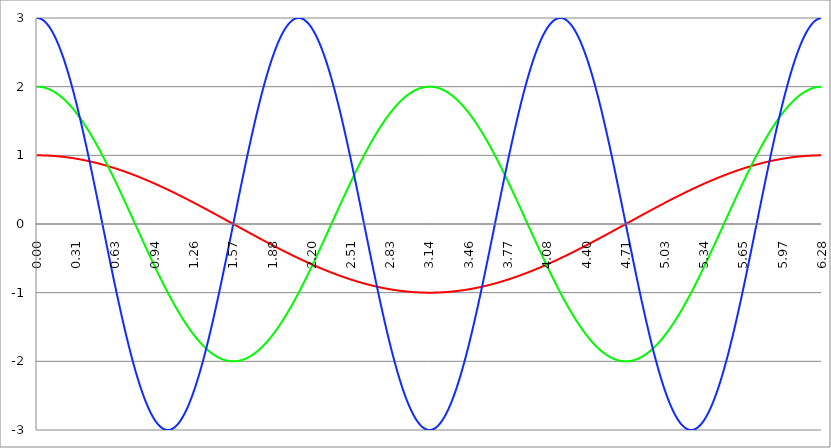
| Category | Series 1 | Series 0 | Series 2 |
|---|---|---|---|
| 0.0 | 1 | 2 | 3 |
| 0.00314159265358979 | 1 | 2 | 3 |
| 0.00628318530717958 | 1 | 2 | 2.999 |
| 0.00942477796076938 | 1 | 2 | 2.999 |
| 0.0125663706143592 | 1 | 1.999 | 2.998 |
| 0.015707963267949 | 1 | 1.999 | 2.997 |
| 0.0188495559215388 | 1 | 1.999 | 2.995 |
| 0.0219911485751285 | 1 | 1.998 | 2.993 |
| 0.0251327412287183 | 1 | 1.997 | 2.991 |
| 0.0282743338823081 | 1 | 1.997 | 2.989 |
| 0.0314159265358979 | 1 | 1.996 | 2.987 |
| 0.0345575191894877 | 0.999 | 1.995 | 2.984 |
| 0.0376991118430775 | 0.999 | 1.994 | 2.981 |
| 0.0408407044966673 | 0.999 | 1.993 | 2.978 |
| 0.0439822971502571 | 0.999 | 1.992 | 2.974 |
| 0.0471238898038469 | 0.999 | 1.991 | 2.97 |
| 0.0502654824574367 | 0.999 | 1.99 | 2.966 |
| 0.0534070751110265 | 0.999 | 1.989 | 2.962 |
| 0.0565486677646163 | 0.998 | 1.987 | 2.957 |
| 0.059690260418206 | 0.998 | 1.986 | 2.952 |
| 0.0628318530717958 | 0.998 | 1.984 | 2.947 |
| 0.0659734457253856 | 0.998 | 1.983 | 2.941 |
| 0.0691150383789754 | 0.998 | 1.981 | 2.936 |
| 0.0722566310325652 | 0.997 | 1.979 | 2.93 |
| 0.075398223686155 | 0.997 | 1.977 | 2.924 |
| 0.0785398163397448 | 0.997 | 1.975 | 2.917 |
| 0.0816814089933346 | 0.997 | 1.973 | 2.91 |
| 0.0848230016469244 | 0.996 | 1.971 | 2.903 |
| 0.0879645943005142 | 0.996 | 1.969 | 2.896 |
| 0.091106186954104 | 0.996 | 1.967 | 2.889 |
| 0.0942477796076937 | 0.996 | 1.965 | 2.881 |
| 0.0973893722612835 | 0.995 | 1.962 | 2.873 |
| 0.100530964914873 | 0.995 | 1.96 | 2.865 |
| 0.103672557568463 | 0.995 | 1.957 | 2.856 |
| 0.106814150222053 | 0.994 | 1.955 | 2.847 |
| 0.109955742875643 | 0.994 | 1.952 | 2.838 |
| 0.113097335529233 | 0.994 | 1.949 | 2.829 |
| 0.116238928182822 | 0.993 | 1.946 | 2.819 |
| 0.119380520836412 | 0.993 | 1.943 | 2.81 |
| 0.122522113490002 | 0.993 | 1.94 | 2.8 |
| 0.125663706143592 | 0.992 | 1.937 | 2.789 |
| 0.128805298797181 | 0.992 | 1.934 | 2.779 |
| 0.131946891450771 | 0.991 | 1.931 | 2.768 |
| 0.135088484104361 | 0.991 | 1.927 | 2.757 |
| 0.138230076757951 | 0.99 | 1.924 | 2.746 |
| 0.141371669411541 | 0.99 | 1.921 | 2.734 |
| 0.14451326206513 | 0.99 | 1.917 | 2.722 |
| 0.14765485471872 | 0.989 | 1.913 | 2.71 |
| 0.15079644737231 | 0.989 | 1.91 | 2.698 |
| 0.1539380400259 | 0.988 | 1.906 | 2.686 |
| 0.15707963267949 | 0.988 | 1.902 | 2.673 |
| 0.160221225333079 | 0.987 | 1.898 | 2.66 |
| 0.163362817986669 | 0.987 | 1.894 | 2.647 |
| 0.166504410640259 | 0.986 | 1.89 | 2.633 |
| 0.169646003293849 | 0.986 | 1.886 | 2.62 |
| 0.172787595947439 | 0.985 | 1.882 | 2.606 |
| 0.175929188601028 | 0.985 | 1.877 | 2.592 |
| 0.179070781254618 | 0.984 | 1.873 | 2.577 |
| 0.182212373908208 | 0.983 | 1.869 | 2.563 |
| 0.185353966561798 | 0.983 | 1.864 | 2.548 |
| 0.188495559215388 | 0.982 | 1.86 | 2.533 |
| 0.191637151868977 | 0.982 | 1.855 | 2.518 |
| 0.194778744522567 | 0.981 | 1.85 | 2.502 |
| 0.197920337176157 | 0.98 | 1.845 | 2.487 |
| 0.201061929829747 | 0.98 | 1.84 | 2.471 |
| 0.204203522483336 | 0.979 | 1.836 | 2.454 |
| 0.207345115136926 | 0.979 | 1.83 | 2.438 |
| 0.210486707790516 | 0.978 | 1.825 | 2.421 |
| 0.213628300444106 | 0.977 | 1.82 | 2.405 |
| 0.216769893097696 | 0.977 | 1.815 | 2.388 |
| 0.219911485751285 | 0.976 | 1.81 | 2.37 |
| 0.223053078404875 | 0.975 | 1.804 | 2.353 |
| 0.226194671058465 | 0.975 | 1.799 | 2.335 |
| 0.229336263712055 | 0.974 | 1.793 | 2.318 |
| 0.232477856365645 | 0.973 | 1.788 | 2.299 |
| 0.235619449019234 | 0.972 | 1.782 | 2.281 |
| 0.238761041672824 | 0.972 | 1.776 | 2.263 |
| 0.241902634326414 | 0.971 | 1.77 | 2.244 |
| 0.245044226980004 | 0.97 | 1.765 | 2.225 |
| 0.248185819633594 | 0.969 | 1.759 | 2.206 |
| 0.251327412287183 | 0.969 | 1.753 | 2.187 |
| 0.254469004940773 | 0.968 | 1.747 | 2.167 |
| 0.257610597594363 | 0.967 | 1.74 | 2.148 |
| 0.260752190247953 | 0.966 | 1.734 | 2.128 |
| 0.263893782901543 | 0.965 | 1.728 | 2.108 |
| 0.267035375555132 | 0.965 | 1.721 | 2.088 |
| 0.270176968208722 | 0.964 | 1.715 | 2.067 |
| 0.273318560862312 | 0.963 | 1.709 | 2.047 |
| 0.276460153515902 | 0.962 | 1.702 | 2.026 |
| 0.279601746169492 | 0.961 | 1.695 | 2.005 |
| 0.282743338823082 | 0.96 | 1.689 | 1.984 |
| 0.285884931476671 | 0.959 | 1.682 | 1.963 |
| 0.289026524130261 | 0.959 | 1.675 | 1.941 |
| 0.292168116783851 | 0.958 | 1.668 | 1.92 |
| 0.295309709437441 | 0.957 | 1.661 | 1.898 |
| 0.298451302091031 | 0.956 | 1.654 | 1.876 |
| 0.30159289474462 | 0.955 | 1.647 | 1.854 |
| 0.30473448739821 | 0.954 | 1.64 | 1.831 |
| 0.3078760800518 | 0.953 | 1.633 | 1.809 |
| 0.31101767270539 | 0.952 | 1.625 | 1.786 |
| 0.31415926535898 | 0.951 | 1.618 | 1.763 |
| 0.31730085801257 | 0.95 | 1.611 | 1.74 |
| 0.320442450666159 | 0.949 | 1.603 | 1.717 |
| 0.323584043319749 | 0.948 | 1.596 | 1.694 |
| 0.326725635973339 | 0.947 | 1.588 | 1.671 |
| 0.329867228626929 | 0.946 | 1.58 | 1.647 |
| 0.333008821280519 | 0.945 | 1.573 | 1.623 |
| 0.336150413934108 | 0.944 | 1.565 | 1.6 |
| 0.339292006587698 | 0.943 | 1.557 | 1.576 |
| 0.342433599241288 | 0.942 | 1.549 | 1.551 |
| 0.345575191894878 | 0.941 | 1.541 | 1.527 |
| 0.348716784548468 | 0.94 | 1.533 | 1.503 |
| 0.351858377202058 | 0.939 | 1.525 | 1.478 |
| 0.354999969855647 | 0.938 | 1.517 | 1.454 |
| 0.358141562509237 | 0.937 | 1.509 | 1.429 |
| 0.361283155162827 | 0.935 | 1.5 | 1.404 |
| 0.364424747816417 | 0.934 | 1.492 | 1.379 |
| 0.367566340470007 | 0.933 | 1.483 | 1.354 |
| 0.370707933123597 | 0.932 | 1.475 | 1.328 |
| 0.373849525777186 | 0.931 | 1.467 | 1.303 |
| 0.376991118430776 | 0.93 | 1.458 | 1.277 |
| 0.380132711084366 | 0.929 | 1.449 | 1.252 |
| 0.383274303737956 | 0.927 | 1.441 | 1.226 |
| 0.386415896391546 | 0.926 | 1.432 | 1.2 |
| 0.389557489045135 | 0.925 | 1.423 | 1.174 |
| 0.392699081698725 | 0.924 | 1.414 | 1.148 |
| 0.395840674352315 | 0.923 | 1.405 | 1.122 |
| 0.398982267005905 | 0.921 | 1.396 | 1.096 |
| 0.402123859659495 | 0.92 | 1.387 | 1.069 |
| 0.405265452313085 | 0.919 | 1.378 | 1.043 |
| 0.408407044966674 | 0.918 | 1.369 | 1.016 |
| 0.411548637620264 | 0.917 | 1.36 | 0.99 |
| 0.414690230273854 | 0.915 | 1.351 | 0.963 |
| 0.417831822927444 | 0.914 | 1.341 | 0.936 |
| 0.420973415581034 | 0.913 | 1.332 | 0.909 |
| 0.424115008234623 | 0.911 | 1.323 | 0.882 |
| 0.427256600888213 | 0.91 | 1.313 | 0.855 |
| 0.430398193541803 | 0.909 | 1.304 | 0.828 |
| 0.433539786195393 | 0.907 | 1.294 | 0.801 |
| 0.436681378848983 | 0.906 | 1.285 | 0.773 |
| 0.439822971502573 | 0.905 | 1.275 | 0.746 |
| 0.442964564156162 | 0.903 | 1.265 | 0.719 |
| 0.446106156809752 | 0.902 | 1.255 | 0.691 |
| 0.449247749463342 | 0.901 | 1.246 | 0.664 |
| 0.452389342116932 | 0.899 | 1.236 | 0.636 |
| 0.455530934770522 | 0.898 | 1.226 | 0.608 |
| 0.458672527424111 | 0.897 | 1.216 | 0.581 |
| 0.461814120077701 | 0.895 | 1.206 | 0.553 |
| 0.464955712731291 | 0.894 | 1.196 | 0.525 |
| 0.468097305384881 | 0.892 | 1.186 | 0.497 |
| 0.471238898038471 | 0.891 | 1.176 | 0.469 |
| 0.474380490692061 | 0.89 | 1.165 | 0.441 |
| 0.47752208334565 | 0.888 | 1.155 | 0.413 |
| 0.48066367599924 | 0.887 | 1.145 | 0.385 |
| 0.48380526865283 | 0.885 | 1.135 | 0.357 |
| 0.48694686130642 | 0.884 | 1.124 | 0.329 |
| 0.49008845396001 | 0.882 | 1.114 | 0.301 |
| 0.493230046613599 | 0.881 | 1.103 | 0.273 |
| 0.496371639267189 | 0.879 | 1.093 | 0.245 |
| 0.499513231920779 | 0.878 | 1.082 | 0.217 |
| 0.502654824574369 | 0.876 | 1.072 | 0.188 |
| 0.505796417227959 | 0.875 | 1.061 | 0.16 |
| 0.508938009881549 | 0.873 | 1.05 | 0.132 |
| 0.512079602535138 | 0.872 | 1.04 | 0.104 |
| 0.515221195188728 | 0.87 | 1.029 | 0.075 |
| 0.518362787842318 | 0.869 | 1.018 | 0.047 |
| 0.521504380495908 | 0.867 | 1.007 | 0.019 |
| 0.524645973149498 | 0.866 | 0.996 | -0.009 |
| 0.527787565803087 | 0.864 | 0.985 | -0.038 |
| 0.530929158456677 | 0.862 | 0.975 | -0.066 |
| 0.534070751110267 | 0.861 | 0.964 | -0.094 |
| 0.537212343763857 | 0.859 | 0.952 | -0.122 |
| 0.540353936417447 | 0.858 | 0.941 | -0.151 |
| 0.543495529071037 | 0.856 | 0.93 | -0.179 |
| 0.546637121724626 | 0.854 | 0.919 | -0.207 |
| 0.549778714378216 | 0.853 | 0.908 | -0.235 |
| 0.552920307031806 | 0.851 | 0.897 | -0.264 |
| 0.556061899685396 | 0.849 | 0.886 | -0.292 |
| 0.559203492338986 | 0.848 | 0.874 | -0.32 |
| 0.562345084992576 | 0.846 | 0.863 | -0.348 |
| 0.565486677646165 | 0.844 | 0.852 | -0.376 |
| 0.568628270299755 | 0.843 | 0.84 | -0.404 |
| 0.571769862953345 | 0.841 | 0.829 | -0.432 |
| 0.574911455606935 | 0.839 | 0.817 | -0.46 |
| 0.578053048260525 | 0.838 | 0.806 | -0.488 |
| 0.581194640914114 | 0.836 | 0.794 | -0.516 |
| 0.584336233567704 | 0.834 | 0.783 | -0.544 |
| 0.587477826221294 | 0.832 | 0.771 | -0.571 |
| 0.590619418874884 | 0.831 | 0.76 | -0.599 |
| 0.593761011528474 | 0.829 | 0.748 | -0.627 |
| 0.596902604182064 | 0.827 | 0.736 | -0.654 |
| 0.600044196835653 | 0.825 | 0.725 | -0.682 |
| 0.603185789489243 | 0.824 | 0.713 | -0.709 |
| 0.606327382142833 | 0.822 | 0.701 | -0.737 |
| 0.609468974796423 | 0.82 | 0.689 | -0.764 |
| 0.612610567450013 | 0.818 | 0.677 | -0.792 |
| 0.615752160103602 | 0.816 | 0.666 | -0.819 |
| 0.618893752757192 | 0.815 | 0.654 | -0.846 |
| 0.622035345410782 | 0.813 | 0.642 | -0.873 |
| 0.625176938064372 | 0.811 | 0.63 | -0.9 |
| 0.628318530717962 | 0.809 | 0.618 | -0.927 |
| 0.631460123371551 | 0.807 | 0.606 | -0.954 |
| 0.634601716025141 | 0.805 | 0.594 | -0.981 |
| 0.637743308678731 | 0.803 | 0.582 | -1.007 |
| 0.640884901332321 | 0.802 | 0.57 | -1.034 |
| 0.644026493985911 | 0.8 | 0.558 | -1.06 |
| 0.647168086639501 | 0.798 | 0.546 | -1.087 |
| 0.65030967929309 | 0.796 | 0.534 | -1.113 |
| 0.65345127194668 | 0.794 | 0.522 | -1.139 |
| 0.65659286460027 | 0.792 | 0.51 | -1.165 |
| 0.65973445725386 | 0.79 | 0.497 | -1.191 |
| 0.66287604990745 | 0.788 | 0.485 | -1.217 |
| 0.666017642561039 | 0.786 | 0.473 | -1.243 |
| 0.669159235214629 | 0.784 | 0.461 | -1.269 |
| 0.672300827868219 | 0.782 | 0.449 | -1.294 |
| 0.675442420521809 | 0.78 | 0.436 | -1.32 |
| 0.678584013175399 | 0.778 | 0.424 | -1.345 |
| 0.681725605828989 | 0.776 | 0.412 | -1.37 |
| 0.684867198482578 | 0.775 | 0.399 | -1.395 |
| 0.688008791136168 | 0.773 | 0.387 | -1.42 |
| 0.691150383789758 | 0.771 | 0.375 | -1.445 |
| 0.694291976443348 | 0.769 | 0.362 | -1.47 |
| 0.697433569096938 | 0.766 | 0.35 | -1.495 |
| 0.700575161750528 | 0.764 | 0.338 | -1.519 |
| 0.703716754404117 | 0.762 | 0.325 | -1.543 |
| 0.706858347057707 | 0.76 | 0.313 | -1.567 |
| 0.709999939711297 | 0.758 | 0.3 | -1.592 |
| 0.713141532364887 | 0.756 | 0.288 | -1.615 |
| 0.716283125018477 | 0.754 | 0.276 | -1.639 |
| 0.719424717672066 | 0.752 | 0.263 | -1.663 |
| 0.722566310325656 | 0.75 | 0.251 | -1.686 |
| 0.725707902979246 | 0.748 | 0.238 | -1.71 |
| 0.728849495632836 | 0.746 | 0.226 | -1.733 |
| 0.731991088286426 | 0.744 | 0.213 | -1.756 |
| 0.735132680940016 | 0.742 | 0.201 | -1.779 |
| 0.738274273593605 | 0.74 | 0.188 | -1.801 |
| 0.741415866247195 | 0.738 | 0.176 | -1.824 |
| 0.744557458900785 | 0.735 | 0.163 | -1.846 |
| 0.747699051554375 | 0.733 | 0.151 | -1.868 |
| 0.750840644207965 | 0.731 | 0.138 | -1.89 |
| 0.753982236861554 | 0.729 | 0.126 | -1.912 |
| 0.757123829515144 | 0.727 | 0.113 | -1.934 |
| 0.760265422168734 | 0.725 | 0.1 | -1.956 |
| 0.763407014822324 | 0.722 | 0.088 | -1.977 |
| 0.766548607475914 | 0.72 | 0.075 | -1.998 |
| 0.769690200129504 | 0.718 | 0.063 | -2.019 |
| 0.772831792783093 | 0.716 | 0.05 | -2.04 |
| 0.775973385436683 | 0.714 | 0.038 | -2.061 |
| 0.779114978090273 | 0.712 | 0.025 | -2.081 |
| 0.782256570743863 | 0.709 | 0.013 | -2.101 |
| 0.785398163397453 | 0.707 | 0 | -2.121 |
| 0.788539756051042 | 0.705 | -0.013 | -2.141 |
| 0.791681348704632 | 0.703 | -0.025 | -2.161 |
| 0.794822941358222 | 0.7 | -0.038 | -2.18 |
| 0.797964534011812 | 0.698 | -0.05 | -2.2 |
| 0.801106126665402 | 0.696 | -0.063 | -2.219 |
| 0.804247719318992 | 0.694 | -0.075 | -2.238 |
| 0.807389311972581 | 0.691 | -0.088 | -2.257 |
| 0.810530904626171 | 0.689 | -0.1 | -2.275 |
| 0.813672497279761 | 0.687 | -0.113 | -2.293 |
| 0.816814089933351 | 0.685 | -0.126 | -2.312 |
| 0.819955682586941 | 0.682 | -0.138 | -2.329 |
| 0.823097275240531 | 0.68 | -0.151 | -2.347 |
| 0.82623886789412 | 0.678 | -0.163 | -2.365 |
| 0.82938046054771 | 0.675 | -0.176 | -2.382 |
| 0.8325220532013 | 0.673 | -0.188 | -2.399 |
| 0.83566364585489 | 0.671 | -0.201 | -2.416 |
| 0.83880523850848 | 0.668 | -0.213 | -2.433 |
| 0.841946831162069 | 0.666 | -0.226 | -2.449 |
| 0.845088423815659 | 0.664 | -0.238 | -2.465 |
| 0.848230016469249 | 0.661 | -0.251 | -2.481 |
| 0.851371609122839 | 0.659 | -0.263 | -2.497 |
| 0.854513201776429 | 0.657 | -0.276 | -2.513 |
| 0.857654794430019 | 0.654 | -0.288 | -2.528 |
| 0.860796387083608 | 0.652 | -0.3 | -2.543 |
| 0.863937979737198 | 0.649 | -0.313 | -2.558 |
| 0.867079572390788 | 0.647 | -0.325 | -2.573 |
| 0.870221165044378 | 0.645 | -0.338 | -2.587 |
| 0.873362757697968 | 0.642 | -0.35 | -2.601 |
| 0.876504350351557 | 0.64 | -0.362 | -2.615 |
| 0.879645943005147 | 0.637 | -0.375 | -2.629 |
| 0.882787535658737 | 0.635 | -0.387 | -2.642 |
| 0.885929128312327 | 0.633 | -0.399 | -2.656 |
| 0.889070720965917 | 0.63 | -0.412 | -2.669 |
| 0.892212313619507 | 0.628 | -0.424 | -2.682 |
| 0.895353906273096 | 0.625 | -0.436 | -2.694 |
| 0.898495498926686 | 0.623 | -0.449 | -2.706 |
| 0.901637091580276 | 0.62 | -0.461 | -2.718 |
| 0.904778684233866 | 0.618 | -0.473 | -2.73 |
| 0.907920276887456 | 0.615 | -0.485 | -2.742 |
| 0.911061869541045 | 0.613 | -0.497 | -2.753 |
| 0.914203462194635 | 0.61 | -0.51 | -2.764 |
| 0.917345054848225 | 0.608 | -0.522 | -2.775 |
| 0.920486647501815 | 0.605 | -0.534 | -2.786 |
| 0.923628240155405 | 0.603 | -0.546 | -2.796 |
| 0.926769832808995 | 0.6 | -0.558 | -2.806 |
| 0.929911425462584 | 0.598 | -0.57 | -2.816 |
| 0.933053018116174 | 0.595 | -0.582 | -2.826 |
| 0.936194610769764 | 0.593 | -0.594 | -2.835 |
| 0.939336203423354 | 0.59 | -0.606 | -2.844 |
| 0.942477796076944 | 0.588 | -0.618 | -2.853 |
| 0.945619388730533 | 0.585 | -0.63 | -2.862 |
| 0.948760981384123 | 0.583 | -0.642 | -2.87 |
| 0.951902574037713 | 0.58 | -0.654 | -2.878 |
| 0.955044166691303 | 0.578 | -0.666 | -2.886 |
| 0.958185759344893 | 0.575 | -0.677 | -2.894 |
| 0.961327351998483 | 0.572 | -0.689 | -2.901 |
| 0.964468944652072 | 0.57 | -0.701 | -2.908 |
| 0.967610537305662 | 0.567 | -0.713 | -2.915 |
| 0.970752129959252 | 0.565 | -0.725 | -2.921 |
| 0.973893722612842 | 0.562 | -0.736 | -2.928 |
| 0.977035315266432 | 0.559 | -0.748 | -2.934 |
| 0.980176907920022 | 0.557 | -0.76 | -2.94 |
| 0.983318500573611 | 0.554 | -0.771 | -2.945 |
| 0.986460093227201 | 0.552 | -0.783 | -2.95 |
| 0.989601685880791 | 0.549 | -0.794 | -2.955 |
| 0.992743278534381 | 0.546 | -0.806 | -2.96 |
| 0.995884871187971 | 0.544 | -0.817 | -2.965 |
| 0.99902646384156 | 0.541 | -0.829 | -2.969 |
| 1.00216805649515 | 0.538 | -0.84 | -2.973 |
| 1.00530964914874 | 0.536 | -0.852 | -2.976 |
| 1.00845124180233 | 0.533 | -0.863 | -2.98 |
| 1.01159283445592 | 0.531 | -0.874 | -2.983 |
| 1.01473442710951 | 0.528 | -0.886 | -2.986 |
| 1.017876019763099 | 0.525 | -0.897 | -2.988 |
| 1.021017612416689 | 0.522 | -0.908 | -2.991 |
| 1.02415920507028 | 0.52 | -0.919 | -2.993 |
| 1.027300797723869 | 0.517 | -0.93 | -2.995 |
| 1.030442390377459 | 0.514 | -0.941 | -2.996 |
| 1.033583983031048 | 0.512 | -0.952 | -2.997 |
| 1.036725575684638 | 0.509 | -0.964 | -2.999 |
| 1.039867168338228 | 0.506 | -0.975 | -2.999 |
| 1.043008760991818 | 0.504 | -0.985 | -3 |
| 1.046150353645408 | 0.501 | -0.996 | -3 |
| 1.049291946298998 | 0.498 | -1.007 | -3 |
| 1.052433538952587 | 0.495 | -1.018 | -3 |
| 1.055575131606177 | 0.493 | -1.029 | -2.999 |
| 1.058716724259767 | 0.49 | -1.04 | -2.998 |
| 1.061858316913357 | 0.487 | -1.05 | -2.997 |
| 1.064999909566947 | 0.485 | -1.061 | -2.996 |
| 1.068141502220536 | 0.482 | -1.072 | -2.994 |
| 1.071283094874126 | 0.479 | -1.082 | -2.992 |
| 1.074424687527716 | 0.476 | -1.093 | -2.99 |
| 1.077566280181306 | 0.473 | -1.103 | -2.988 |
| 1.080707872834896 | 0.471 | -1.114 | -2.985 |
| 1.083849465488486 | 0.468 | -1.124 | -2.982 |
| 1.086991058142075 | 0.465 | -1.135 | -2.979 |
| 1.090132650795665 | 0.462 | -1.145 | -2.975 |
| 1.093274243449255 | 0.46 | -1.155 | -2.971 |
| 1.096415836102845 | 0.457 | -1.165 | -2.967 |
| 1.099557428756435 | 0.454 | -1.176 | -2.963 |
| 1.102699021410025 | 0.451 | -1.186 | -2.959 |
| 1.105840614063614 | 0.448 | -1.196 | -2.954 |
| 1.108982206717204 | 0.446 | -1.206 | -2.949 |
| 1.112123799370794 | 0.443 | -1.216 | -2.943 |
| 1.115265392024384 | 0.44 | -1.226 | -2.938 |
| 1.118406984677974 | 0.437 | -1.236 | -2.932 |
| 1.121548577331563 | 0.434 | -1.246 | -2.926 |
| 1.124690169985153 | 0.431 | -1.255 | -2.919 |
| 1.127831762638743 | 0.429 | -1.265 | -2.913 |
| 1.130973355292333 | 0.426 | -1.275 | -2.906 |
| 1.134114947945923 | 0.423 | -1.285 | -2.899 |
| 1.137256540599513 | 0.42 | -1.294 | -2.891 |
| 1.140398133253102 | 0.417 | -1.304 | -2.883 |
| 1.143539725906692 | 0.414 | -1.313 | -2.876 |
| 1.146681318560282 | 0.412 | -1.323 | -2.867 |
| 1.149822911213872 | 0.409 | -1.332 | -2.859 |
| 1.152964503867462 | 0.406 | -1.341 | -2.85 |
| 1.156106096521051 | 0.403 | -1.351 | -2.841 |
| 1.159247689174641 | 0.4 | -1.36 | -2.832 |
| 1.162389281828231 | 0.397 | -1.369 | -2.823 |
| 1.165530874481821 | 0.394 | -1.378 | -2.813 |
| 1.168672467135411 | 0.391 | -1.387 | -2.803 |
| 1.171814059789001 | 0.388 | -1.396 | -2.793 |
| 1.17495565244259 | 0.386 | -1.405 | -2.782 |
| 1.17809724509618 | 0.383 | -1.414 | -2.772 |
| 1.18123883774977 | 0.38 | -1.423 | -2.761 |
| 1.18438043040336 | 0.377 | -1.432 | -2.75 |
| 1.18752202305695 | 0.374 | -1.441 | -2.738 |
| 1.190663615710539 | 0.371 | -1.449 | -2.726 |
| 1.193805208364129 | 0.368 | -1.458 | -2.714 |
| 1.19694680101772 | 0.365 | -1.467 | -2.702 |
| 1.200088393671309 | 0.362 | -1.475 | -2.69 |
| 1.203229986324899 | 0.359 | -1.483 | -2.677 |
| 1.206371578978489 | 0.356 | -1.492 | -2.664 |
| 1.209513171632078 | 0.353 | -1.5 | -2.651 |
| 1.212654764285668 | 0.351 | -1.509 | -2.638 |
| 1.215796356939258 | 0.348 | -1.517 | -2.624 |
| 1.218937949592848 | 0.345 | -1.525 | -2.611 |
| 1.222079542246438 | 0.342 | -1.533 | -2.597 |
| 1.225221134900027 | 0.339 | -1.541 | -2.582 |
| 1.228362727553617 | 0.336 | -1.549 | -2.568 |
| 1.231504320207207 | 0.333 | -1.557 | -2.553 |
| 1.234645912860797 | 0.33 | -1.565 | -2.538 |
| 1.237787505514387 | 0.327 | -1.573 | -2.523 |
| 1.240929098167977 | 0.324 | -1.58 | -2.507 |
| 1.244070690821566 | 0.321 | -1.588 | -2.492 |
| 1.247212283475156 | 0.318 | -1.596 | -2.476 |
| 1.250353876128746 | 0.315 | -1.603 | -2.46 |
| 1.253495468782336 | 0.312 | -1.611 | -2.444 |
| 1.256637061435926 | 0.309 | -1.618 | -2.427 |
| 1.259778654089515 | 0.306 | -1.625 | -2.41 |
| 1.262920246743105 | 0.303 | -1.633 | -2.393 |
| 1.266061839396695 | 0.3 | -1.64 | -2.376 |
| 1.269203432050285 | 0.297 | -1.647 | -2.359 |
| 1.272345024703875 | 0.294 | -1.654 | -2.341 |
| 1.275486617357465 | 0.291 | -1.661 | -2.324 |
| 1.278628210011054 | 0.288 | -1.668 | -2.306 |
| 1.281769802664644 | 0.285 | -1.675 | -2.287 |
| 1.284911395318234 | 0.282 | -1.682 | -2.269 |
| 1.288052987971824 | 0.279 | -1.689 | -2.25 |
| 1.291194580625414 | 0.276 | -1.695 | -2.232 |
| 1.294336173279003 | 0.273 | -1.702 | -2.213 |
| 1.297477765932593 | 0.27 | -1.709 | -2.193 |
| 1.300619358586183 | 0.267 | -1.715 | -2.174 |
| 1.303760951239773 | 0.264 | -1.721 | -2.154 |
| 1.306902543893363 | 0.261 | -1.728 | -2.135 |
| 1.310044136546953 | 0.258 | -1.734 | -2.115 |
| 1.313185729200542 | 0.255 | -1.74 | -2.094 |
| 1.316327321854132 | 0.252 | -1.747 | -2.074 |
| 1.319468914507722 | 0.249 | -1.753 | -2.054 |
| 1.322610507161312 | 0.246 | -1.759 | -2.033 |
| 1.325752099814902 | 0.243 | -1.765 | -2.012 |
| 1.328893692468491 | 0.24 | -1.77 | -1.991 |
| 1.332035285122081 | 0.236 | -1.776 | -1.97 |
| 1.335176877775671 | 0.233 | -1.782 | -1.948 |
| 1.338318470429261 | 0.23 | -1.788 | -1.927 |
| 1.341460063082851 | 0.227 | -1.793 | -1.905 |
| 1.344601655736441 | 0.224 | -1.799 | -1.883 |
| 1.34774324839003 | 0.221 | -1.804 | -1.861 |
| 1.35088484104362 | 0.218 | -1.81 | -1.839 |
| 1.35402643369721 | 0.215 | -1.815 | -1.816 |
| 1.3571680263508 | 0.212 | -1.82 | -1.794 |
| 1.36030961900439 | 0.209 | -1.825 | -1.771 |
| 1.363451211657979 | 0.206 | -1.83 | -1.748 |
| 1.36659280431157 | 0.203 | -1.836 | -1.725 |
| 1.369734396965159 | 0.2 | -1.84 | -1.702 |
| 1.372875989618749 | 0.197 | -1.845 | -1.678 |
| 1.376017582272339 | 0.194 | -1.85 | -1.655 |
| 1.379159174925929 | 0.19 | -1.855 | -1.631 |
| 1.382300767579518 | 0.187 | -1.86 | -1.607 |
| 1.385442360233108 | 0.184 | -1.864 | -1.584 |
| 1.388583952886698 | 0.181 | -1.869 | -1.559 |
| 1.391725545540288 | 0.178 | -1.873 | -1.535 |
| 1.394867138193878 | 0.175 | -1.877 | -1.511 |
| 1.398008730847468 | 0.172 | -1.882 | -1.486 |
| 1.401150323501057 | 0.169 | -1.886 | -1.462 |
| 1.404291916154647 | 0.166 | -1.89 | -1.437 |
| 1.407433508808237 | 0.163 | -1.894 | -1.412 |
| 1.410575101461827 | 0.16 | -1.898 | -1.387 |
| 1.413716694115417 | 0.156 | -1.902 | -1.362 |
| 1.416858286769006 | 0.153 | -1.906 | -1.337 |
| 1.419999879422596 | 0.15 | -1.91 | -1.311 |
| 1.423141472076186 | 0.147 | -1.913 | -1.286 |
| 1.426283064729776 | 0.144 | -1.917 | -1.26 |
| 1.429424657383366 | 0.141 | -1.921 | -1.235 |
| 1.432566250036956 | 0.138 | -1.924 | -1.209 |
| 1.435707842690545 | 0.135 | -1.927 | -1.183 |
| 1.438849435344135 | 0.132 | -1.931 | -1.157 |
| 1.441991027997725 | 0.128 | -1.934 | -1.131 |
| 1.445132620651315 | 0.125 | -1.937 | -1.104 |
| 1.448274213304905 | 0.122 | -1.94 | -1.078 |
| 1.451415805958494 | 0.119 | -1.943 | -1.052 |
| 1.454557398612084 | 0.116 | -1.946 | -1.025 |
| 1.457698991265674 | 0.113 | -1.949 | -0.998 |
| 1.460840583919264 | 0.11 | -1.952 | -0.972 |
| 1.463982176572854 | 0.107 | -1.955 | -0.945 |
| 1.467123769226444 | 0.103 | -1.957 | -0.918 |
| 1.470265361880033 | 0.1 | -1.96 | -0.891 |
| 1.473406954533623 | 0.097 | -1.962 | -0.864 |
| 1.476548547187213 | 0.094 | -1.965 | -0.837 |
| 1.479690139840803 | 0.091 | -1.967 | -0.81 |
| 1.482831732494393 | 0.088 | -1.969 | -0.783 |
| 1.485973325147982 | 0.085 | -1.971 | -0.755 |
| 1.489114917801572 | 0.082 | -1.973 | -0.728 |
| 1.492256510455162 | 0.078 | -1.975 | -0.7 |
| 1.495398103108752 | 0.075 | -1.977 | -0.673 |
| 1.498539695762342 | 0.072 | -1.979 | -0.645 |
| 1.501681288415932 | 0.069 | -1.981 | -0.618 |
| 1.504822881069521 | 0.066 | -1.983 | -0.59 |
| 1.507964473723111 | 0.063 | -1.984 | -0.562 |
| 1.511106066376701 | 0.06 | -1.986 | -0.534 |
| 1.514247659030291 | 0.057 | -1.987 | -0.507 |
| 1.517389251683881 | 0.053 | -1.989 | -0.479 |
| 1.520530844337471 | 0.05 | -1.99 | -0.451 |
| 1.52367243699106 | 0.047 | -1.991 | -0.423 |
| 1.52681402964465 | 0.044 | -1.992 | -0.395 |
| 1.52995562229824 | 0.041 | -1.993 | -0.367 |
| 1.53309721495183 | 0.038 | -1.994 | -0.339 |
| 1.53623880760542 | 0.035 | -1.995 | -0.31 |
| 1.539380400259009 | 0.031 | -1.996 | -0.282 |
| 1.542521992912599 | 0.028 | -1.997 | -0.254 |
| 1.545663585566189 | 0.025 | -1.997 | -0.226 |
| 1.548805178219779 | 0.022 | -1.998 | -0.198 |
| 1.551946770873369 | 0.019 | -1.999 | -0.17 |
| 1.555088363526959 | 0.016 | -1.999 | -0.141 |
| 1.558229956180548 | 0.013 | -1.999 | -0.113 |
| 1.561371548834138 | 0.009 | -2 | -0.085 |
| 1.564513141487728 | 0.006 | -2 | -0.057 |
| 1.567654734141318 | 0.003 | -2 | -0.028 |
| 1.570796326794908 | 0 | -2 | 0 |
| 1.573937919448497 | -0.003 | -2 | 0.028 |
| 1.577079512102087 | -0.006 | -2 | 0.057 |
| 1.580221104755677 | -0.009 | -2 | 0.085 |
| 1.583362697409267 | -0.013 | -1.999 | 0.113 |
| 1.586504290062857 | -0.016 | -1.999 | 0.141 |
| 1.589645882716447 | -0.019 | -1.999 | 0.17 |
| 1.592787475370036 | -0.022 | -1.998 | 0.198 |
| 1.595929068023626 | -0.025 | -1.997 | 0.226 |
| 1.599070660677216 | -0.028 | -1.997 | 0.254 |
| 1.602212253330806 | -0.031 | -1.996 | 0.282 |
| 1.605353845984396 | -0.035 | -1.995 | 0.31 |
| 1.608495438637985 | -0.038 | -1.994 | 0.339 |
| 1.611637031291575 | -0.041 | -1.993 | 0.367 |
| 1.614778623945165 | -0.044 | -1.992 | 0.395 |
| 1.617920216598755 | -0.047 | -1.991 | 0.423 |
| 1.621061809252345 | -0.05 | -1.99 | 0.451 |
| 1.624203401905935 | -0.053 | -1.989 | 0.479 |
| 1.627344994559524 | -0.057 | -1.987 | 0.507 |
| 1.630486587213114 | -0.06 | -1.986 | 0.534 |
| 1.633628179866704 | -0.063 | -1.984 | 0.562 |
| 1.636769772520294 | -0.066 | -1.983 | 0.59 |
| 1.639911365173884 | -0.069 | -1.981 | 0.618 |
| 1.643052957827473 | -0.072 | -1.979 | 0.645 |
| 1.646194550481063 | -0.075 | -1.977 | 0.673 |
| 1.649336143134653 | -0.078 | -1.975 | 0.7 |
| 1.652477735788243 | -0.082 | -1.973 | 0.728 |
| 1.655619328441833 | -0.085 | -1.971 | 0.755 |
| 1.658760921095423 | -0.088 | -1.969 | 0.783 |
| 1.661902513749012 | -0.091 | -1.967 | 0.81 |
| 1.665044106402602 | -0.094 | -1.965 | 0.837 |
| 1.668185699056192 | -0.097 | -1.962 | 0.864 |
| 1.671327291709782 | -0.1 | -1.96 | 0.891 |
| 1.674468884363372 | -0.103 | -1.957 | 0.918 |
| 1.677610477016961 | -0.107 | -1.955 | 0.945 |
| 1.680752069670551 | -0.11 | -1.952 | 0.972 |
| 1.683893662324141 | -0.113 | -1.949 | 0.998 |
| 1.687035254977731 | -0.116 | -1.946 | 1.025 |
| 1.690176847631321 | -0.119 | -1.943 | 1.052 |
| 1.693318440284911 | -0.122 | -1.94 | 1.078 |
| 1.6964600329385 | -0.125 | -1.937 | 1.104 |
| 1.69960162559209 | -0.128 | -1.934 | 1.131 |
| 1.70274321824568 | -0.132 | -1.931 | 1.157 |
| 1.70588481089927 | -0.135 | -1.927 | 1.183 |
| 1.70902640355286 | -0.138 | -1.924 | 1.209 |
| 1.712167996206449 | -0.141 | -1.921 | 1.235 |
| 1.715309588860039 | -0.144 | -1.917 | 1.26 |
| 1.71845118151363 | -0.147 | -1.913 | 1.286 |
| 1.721592774167219 | -0.15 | -1.91 | 1.311 |
| 1.724734366820809 | -0.153 | -1.906 | 1.337 |
| 1.727875959474399 | -0.156 | -1.902 | 1.362 |
| 1.731017552127988 | -0.16 | -1.898 | 1.387 |
| 1.734159144781578 | -0.163 | -1.894 | 1.412 |
| 1.737300737435168 | -0.166 | -1.89 | 1.437 |
| 1.740442330088758 | -0.169 | -1.886 | 1.462 |
| 1.743583922742348 | -0.172 | -1.882 | 1.486 |
| 1.746725515395937 | -0.175 | -1.877 | 1.511 |
| 1.749867108049527 | -0.178 | -1.873 | 1.535 |
| 1.753008700703117 | -0.181 | -1.869 | 1.559 |
| 1.756150293356707 | -0.184 | -1.864 | 1.584 |
| 1.759291886010297 | -0.187 | -1.86 | 1.607 |
| 1.762433478663887 | -0.19 | -1.855 | 1.631 |
| 1.765575071317476 | -0.194 | -1.85 | 1.655 |
| 1.768716663971066 | -0.197 | -1.845 | 1.678 |
| 1.771858256624656 | -0.2 | -1.84 | 1.702 |
| 1.774999849278246 | -0.203 | -1.836 | 1.725 |
| 1.778141441931836 | -0.206 | -1.83 | 1.748 |
| 1.781283034585426 | -0.209 | -1.825 | 1.771 |
| 1.784424627239015 | -0.212 | -1.82 | 1.794 |
| 1.787566219892605 | -0.215 | -1.815 | 1.816 |
| 1.790707812546195 | -0.218 | -1.81 | 1.839 |
| 1.793849405199785 | -0.221 | -1.804 | 1.861 |
| 1.796990997853375 | -0.224 | -1.799 | 1.883 |
| 1.800132590506964 | -0.227 | -1.793 | 1.905 |
| 1.803274183160554 | -0.23 | -1.788 | 1.927 |
| 1.806415775814144 | -0.233 | -1.782 | 1.948 |
| 1.809557368467734 | -0.236 | -1.776 | 1.97 |
| 1.812698961121324 | -0.24 | -1.77 | 1.991 |
| 1.815840553774914 | -0.243 | -1.765 | 2.012 |
| 1.818982146428503 | -0.246 | -1.759 | 2.033 |
| 1.822123739082093 | -0.249 | -1.753 | 2.054 |
| 1.825265331735683 | -0.252 | -1.747 | 2.074 |
| 1.828406924389273 | -0.255 | -1.74 | 2.094 |
| 1.831548517042863 | -0.258 | -1.734 | 2.115 |
| 1.834690109696452 | -0.261 | -1.728 | 2.135 |
| 1.837831702350042 | -0.264 | -1.721 | 2.154 |
| 1.840973295003632 | -0.267 | -1.715 | 2.174 |
| 1.844114887657222 | -0.27 | -1.709 | 2.193 |
| 1.847256480310812 | -0.273 | -1.702 | 2.213 |
| 1.850398072964402 | -0.276 | -1.695 | 2.232 |
| 1.853539665617991 | -0.279 | -1.689 | 2.25 |
| 1.856681258271581 | -0.282 | -1.682 | 2.269 |
| 1.859822850925171 | -0.285 | -1.675 | 2.287 |
| 1.862964443578761 | -0.288 | -1.668 | 2.306 |
| 1.866106036232351 | -0.291 | -1.661 | 2.324 |
| 1.86924762888594 | -0.294 | -1.654 | 2.341 |
| 1.87238922153953 | -0.297 | -1.647 | 2.359 |
| 1.87553081419312 | -0.3 | -1.64 | 2.376 |
| 1.87867240684671 | -0.303 | -1.633 | 2.393 |
| 1.8818139995003 | -0.306 | -1.625 | 2.41 |
| 1.88495559215389 | -0.309 | -1.618 | 2.427 |
| 1.888097184807479 | -0.312 | -1.611 | 2.444 |
| 1.891238777461069 | -0.315 | -1.603 | 2.46 |
| 1.89438037011466 | -0.318 | -1.596 | 2.476 |
| 1.897521962768249 | -0.321 | -1.588 | 2.492 |
| 1.900663555421839 | -0.324 | -1.58 | 2.507 |
| 1.903805148075429 | -0.327 | -1.573 | 2.523 |
| 1.906946740729018 | -0.33 | -1.565 | 2.538 |
| 1.910088333382608 | -0.333 | -1.557 | 2.553 |
| 1.913229926036198 | -0.336 | -1.549 | 2.568 |
| 1.916371518689788 | -0.339 | -1.541 | 2.582 |
| 1.919513111343378 | -0.342 | -1.533 | 2.597 |
| 1.922654703996967 | -0.345 | -1.525 | 2.611 |
| 1.925796296650557 | -0.348 | -1.517 | 2.624 |
| 1.928937889304147 | -0.351 | -1.509 | 2.638 |
| 1.932079481957737 | -0.353 | -1.5 | 2.651 |
| 1.935221074611327 | -0.356 | -1.492 | 2.664 |
| 1.938362667264917 | -0.359 | -1.483 | 2.677 |
| 1.941504259918506 | -0.362 | -1.475 | 2.69 |
| 1.944645852572096 | -0.365 | -1.467 | 2.702 |
| 1.947787445225686 | -0.368 | -1.458 | 2.714 |
| 1.950929037879276 | -0.371 | -1.449 | 2.726 |
| 1.954070630532866 | -0.374 | -1.441 | 2.738 |
| 1.957212223186455 | -0.377 | -1.432 | 2.75 |
| 1.960353815840045 | -0.38 | -1.423 | 2.761 |
| 1.963495408493635 | -0.383 | -1.414 | 2.772 |
| 1.966637001147225 | -0.386 | -1.405 | 2.782 |
| 1.969778593800815 | -0.388 | -1.396 | 2.793 |
| 1.972920186454405 | -0.391 | -1.387 | 2.803 |
| 1.976061779107994 | -0.394 | -1.378 | 2.813 |
| 1.979203371761584 | -0.397 | -1.369 | 2.823 |
| 1.982344964415174 | -0.4 | -1.36 | 2.832 |
| 1.985486557068764 | -0.403 | -1.351 | 2.841 |
| 1.988628149722354 | -0.406 | -1.341 | 2.85 |
| 1.991769742375943 | -0.409 | -1.332 | 2.859 |
| 1.994911335029533 | -0.412 | -1.323 | 2.867 |
| 1.998052927683123 | -0.414 | -1.313 | 2.876 |
| 2.001194520336712 | -0.417 | -1.304 | 2.883 |
| 2.004336112990302 | -0.42 | -1.294 | 2.891 |
| 2.007477705643892 | -0.423 | -1.285 | 2.899 |
| 2.010619298297482 | -0.426 | -1.275 | 2.906 |
| 2.013760890951071 | -0.429 | -1.265 | 2.913 |
| 2.016902483604661 | -0.431 | -1.255 | 2.919 |
| 2.02004407625825 | -0.434 | -1.246 | 2.926 |
| 2.02318566891184 | -0.437 | -1.236 | 2.932 |
| 2.02632726156543 | -0.44 | -1.226 | 2.938 |
| 2.029468854219019 | -0.443 | -1.216 | 2.943 |
| 2.032610446872609 | -0.446 | -1.206 | 2.949 |
| 2.035752039526198 | -0.448 | -1.196 | 2.954 |
| 2.038893632179788 | -0.451 | -1.186 | 2.959 |
| 2.042035224833378 | -0.454 | -1.176 | 2.963 |
| 2.045176817486967 | -0.457 | -1.165 | 2.967 |
| 2.048318410140557 | -0.46 | -1.155 | 2.971 |
| 2.051460002794146 | -0.462 | -1.145 | 2.975 |
| 2.054601595447736 | -0.465 | -1.135 | 2.979 |
| 2.057743188101325 | -0.468 | -1.124 | 2.982 |
| 2.060884780754915 | -0.471 | -1.114 | 2.985 |
| 2.064026373408505 | -0.473 | -1.103 | 2.988 |
| 2.067167966062094 | -0.476 | -1.093 | 2.99 |
| 2.070309558715684 | -0.479 | -1.082 | 2.992 |
| 2.073451151369273 | -0.482 | -1.072 | 2.994 |
| 2.076592744022863 | -0.485 | -1.061 | 2.996 |
| 2.079734336676452 | -0.487 | -1.05 | 2.997 |
| 2.082875929330042 | -0.49 | -1.04 | 2.998 |
| 2.086017521983632 | -0.493 | -1.029 | 2.999 |
| 2.089159114637221 | -0.495 | -1.018 | 3 |
| 2.092300707290811 | -0.498 | -1.007 | 3 |
| 2.095442299944401 | -0.501 | -0.996 | 3 |
| 2.09858389259799 | -0.504 | -0.985 | 3 |
| 2.10172548525158 | -0.506 | -0.975 | 2.999 |
| 2.104867077905169 | -0.509 | -0.964 | 2.999 |
| 2.108008670558759 | -0.512 | -0.952 | 2.997 |
| 2.111150263212349 | -0.514 | -0.941 | 2.996 |
| 2.114291855865938 | -0.517 | -0.93 | 2.995 |
| 2.117433448519528 | -0.52 | -0.919 | 2.993 |
| 2.120575041173117 | -0.522 | -0.908 | 2.991 |
| 2.123716633826707 | -0.525 | -0.897 | 2.988 |
| 2.126858226480297 | -0.528 | -0.886 | 2.986 |
| 2.129999819133886 | -0.531 | -0.874 | 2.983 |
| 2.133141411787476 | -0.533 | -0.863 | 2.98 |
| 2.136283004441065 | -0.536 | -0.852 | 2.976 |
| 2.139424597094655 | -0.538 | -0.84 | 2.973 |
| 2.142566189748245 | -0.541 | -0.829 | 2.969 |
| 2.145707782401834 | -0.544 | -0.817 | 2.965 |
| 2.148849375055424 | -0.546 | -0.806 | 2.96 |
| 2.151990967709013 | -0.549 | -0.794 | 2.955 |
| 2.155132560362603 | -0.552 | -0.783 | 2.95 |
| 2.158274153016193 | -0.554 | -0.771 | 2.945 |
| 2.161415745669782 | -0.557 | -0.76 | 2.94 |
| 2.164557338323372 | -0.559 | -0.748 | 2.934 |
| 2.167698930976961 | -0.562 | -0.736 | 2.928 |
| 2.170840523630551 | -0.565 | -0.725 | 2.921 |
| 2.173982116284141 | -0.567 | -0.713 | 2.915 |
| 2.17712370893773 | -0.57 | -0.701 | 2.908 |
| 2.18026530159132 | -0.572 | -0.689 | 2.901 |
| 2.183406894244909 | -0.575 | -0.677 | 2.894 |
| 2.186548486898499 | -0.578 | -0.666 | 2.886 |
| 2.189690079552089 | -0.58 | -0.654 | 2.878 |
| 2.192831672205678 | -0.583 | -0.642 | 2.87 |
| 2.195973264859268 | -0.585 | -0.63 | 2.862 |
| 2.199114857512857 | -0.588 | -0.618 | 2.853 |
| 2.202256450166447 | -0.59 | -0.606 | 2.844 |
| 2.205398042820036 | -0.593 | -0.594 | 2.835 |
| 2.208539635473626 | -0.595 | -0.582 | 2.826 |
| 2.211681228127216 | -0.598 | -0.57 | 2.816 |
| 2.214822820780805 | -0.6 | -0.558 | 2.806 |
| 2.217964413434395 | -0.603 | -0.546 | 2.796 |
| 2.221106006087984 | -0.605 | -0.534 | 2.786 |
| 2.224247598741574 | -0.608 | -0.522 | 2.775 |
| 2.227389191395164 | -0.61 | -0.51 | 2.764 |
| 2.230530784048753 | -0.613 | -0.497 | 2.753 |
| 2.233672376702343 | -0.615 | -0.485 | 2.742 |
| 2.236813969355933 | -0.618 | -0.473 | 2.73 |
| 2.239955562009522 | -0.62 | -0.461 | 2.718 |
| 2.243097154663112 | -0.623 | -0.449 | 2.706 |
| 2.246238747316701 | -0.625 | -0.436 | 2.694 |
| 2.249380339970291 | -0.628 | -0.424 | 2.682 |
| 2.252521932623881 | -0.63 | -0.412 | 2.669 |
| 2.25566352527747 | -0.633 | -0.399 | 2.656 |
| 2.25880511793106 | -0.635 | -0.387 | 2.642 |
| 2.261946710584649 | -0.637 | -0.375 | 2.629 |
| 2.265088303238239 | -0.64 | -0.362 | 2.615 |
| 2.268229895891829 | -0.642 | -0.35 | 2.601 |
| 2.271371488545418 | -0.645 | -0.338 | 2.587 |
| 2.274513081199008 | -0.647 | -0.325 | 2.573 |
| 2.277654673852597 | -0.649 | -0.313 | 2.558 |
| 2.280796266506186 | -0.652 | -0.3 | 2.543 |
| 2.283937859159776 | -0.654 | -0.288 | 2.528 |
| 2.287079451813366 | -0.657 | -0.276 | 2.513 |
| 2.290221044466955 | -0.659 | -0.263 | 2.497 |
| 2.293362637120545 | -0.661 | -0.251 | 2.481 |
| 2.296504229774135 | -0.664 | -0.238 | 2.465 |
| 2.299645822427724 | -0.666 | -0.226 | 2.449 |
| 2.302787415081314 | -0.668 | -0.213 | 2.433 |
| 2.305929007734904 | -0.671 | -0.201 | 2.416 |
| 2.309070600388493 | -0.673 | -0.188 | 2.399 |
| 2.312212193042083 | -0.675 | -0.176 | 2.382 |
| 2.315353785695672 | -0.678 | -0.163 | 2.365 |
| 2.318495378349262 | -0.68 | -0.151 | 2.347 |
| 2.321636971002852 | -0.682 | -0.138 | 2.329 |
| 2.324778563656441 | -0.685 | -0.126 | 2.312 |
| 2.327920156310031 | -0.687 | -0.113 | 2.293 |
| 2.33106174896362 | -0.689 | -0.1 | 2.275 |
| 2.33420334161721 | -0.691 | -0.088 | 2.257 |
| 2.3373449342708 | -0.694 | -0.075 | 2.238 |
| 2.340486526924389 | -0.696 | -0.063 | 2.219 |
| 2.343628119577979 | -0.698 | -0.05 | 2.2 |
| 2.346769712231568 | -0.7 | -0.038 | 2.18 |
| 2.349911304885158 | -0.703 | -0.025 | 2.161 |
| 2.353052897538748 | -0.705 | -0.013 | 2.141 |
| 2.356194490192337 | -0.707 | 0 | 2.121 |
| 2.359336082845927 | -0.709 | 0.013 | 2.101 |
| 2.362477675499516 | -0.712 | 0.025 | 2.081 |
| 2.365619268153106 | -0.714 | 0.038 | 2.061 |
| 2.368760860806696 | -0.716 | 0.05 | 2.04 |
| 2.371902453460285 | -0.718 | 0.063 | 2.019 |
| 2.375044046113875 | -0.72 | 0.075 | 1.998 |
| 2.378185638767464 | -0.722 | 0.088 | 1.977 |
| 2.381327231421054 | -0.725 | 0.1 | 1.956 |
| 2.384468824074644 | -0.727 | 0.113 | 1.934 |
| 2.387610416728233 | -0.729 | 0.126 | 1.912 |
| 2.390752009381823 | -0.731 | 0.138 | 1.89 |
| 2.393893602035412 | -0.733 | 0.151 | 1.868 |
| 2.397035194689002 | -0.735 | 0.163 | 1.846 |
| 2.400176787342591 | -0.738 | 0.176 | 1.824 |
| 2.403318379996181 | -0.74 | 0.188 | 1.801 |
| 2.406459972649771 | -0.742 | 0.201 | 1.779 |
| 2.40960156530336 | -0.744 | 0.213 | 1.756 |
| 2.41274315795695 | -0.746 | 0.226 | 1.733 |
| 2.41588475061054 | -0.748 | 0.238 | 1.71 |
| 2.419026343264129 | -0.75 | 0.251 | 1.686 |
| 2.422167935917719 | -0.752 | 0.263 | 1.663 |
| 2.425309528571308 | -0.754 | 0.276 | 1.639 |
| 2.428451121224898 | -0.756 | 0.288 | 1.615 |
| 2.431592713878488 | -0.758 | 0.3 | 1.592 |
| 2.434734306532077 | -0.76 | 0.313 | 1.567 |
| 2.437875899185667 | -0.762 | 0.325 | 1.543 |
| 2.441017491839256 | -0.764 | 0.338 | 1.519 |
| 2.444159084492846 | -0.766 | 0.35 | 1.495 |
| 2.447300677146435 | -0.769 | 0.362 | 1.47 |
| 2.450442269800025 | -0.771 | 0.375 | 1.445 |
| 2.453583862453615 | -0.773 | 0.387 | 1.42 |
| 2.456725455107204 | -0.775 | 0.399 | 1.395 |
| 2.459867047760794 | -0.776 | 0.412 | 1.37 |
| 2.463008640414384 | -0.778 | 0.424 | 1.345 |
| 2.466150233067973 | -0.78 | 0.436 | 1.32 |
| 2.469291825721563 | -0.782 | 0.449 | 1.294 |
| 2.472433418375152 | -0.784 | 0.461 | 1.269 |
| 2.475575011028742 | -0.786 | 0.473 | 1.243 |
| 2.478716603682332 | -0.788 | 0.485 | 1.217 |
| 2.481858196335921 | -0.79 | 0.497 | 1.191 |
| 2.48499978898951 | -0.792 | 0.51 | 1.165 |
| 2.4881413816431 | -0.794 | 0.522 | 1.139 |
| 2.49128297429669 | -0.796 | 0.534 | 1.113 |
| 2.49442456695028 | -0.798 | 0.546 | 1.087 |
| 2.497566159603869 | -0.8 | 0.558 | 1.06 |
| 2.500707752257458 | -0.802 | 0.57 | 1.034 |
| 2.503849344911048 | -0.803 | 0.582 | 1.007 |
| 2.506990937564638 | -0.805 | 0.594 | 0.981 |
| 2.510132530218228 | -0.807 | 0.606 | 0.954 |
| 2.513274122871817 | -0.809 | 0.618 | 0.927 |
| 2.516415715525407 | -0.811 | 0.63 | 0.9 |
| 2.519557308178996 | -0.813 | 0.642 | 0.873 |
| 2.522698900832586 | -0.815 | 0.654 | 0.846 |
| 2.525840493486176 | -0.816 | 0.666 | 0.819 |
| 2.528982086139765 | -0.818 | 0.677 | 0.792 |
| 2.532123678793355 | -0.82 | 0.689 | 0.764 |
| 2.535265271446944 | -0.822 | 0.701 | 0.737 |
| 2.538406864100534 | -0.824 | 0.713 | 0.709 |
| 2.541548456754124 | -0.825 | 0.725 | 0.682 |
| 2.544690049407713 | -0.827 | 0.736 | 0.654 |
| 2.547831642061302 | -0.829 | 0.748 | 0.627 |
| 2.550973234714892 | -0.831 | 0.76 | 0.599 |
| 2.554114827368482 | -0.832 | 0.771 | 0.571 |
| 2.557256420022072 | -0.834 | 0.783 | 0.544 |
| 2.560398012675661 | -0.836 | 0.794 | 0.516 |
| 2.563539605329251 | -0.838 | 0.806 | 0.488 |
| 2.56668119798284 | -0.839 | 0.817 | 0.46 |
| 2.56982279063643 | -0.841 | 0.829 | 0.432 |
| 2.57296438329002 | -0.843 | 0.84 | 0.404 |
| 2.576105975943609 | -0.844 | 0.852 | 0.376 |
| 2.579247568597199 | -0.846 | 0.863 | 0.348 |
| 2.582389161250788 | -0.848 | 0.874 | 0.32 |
| 2.585530753904377 | -0.849 | 0.886 | 0.292 |
| 2.588672346557967 | -0.851 | 0.897 | 0.264 |
| 2.591813939211557 | -0.853 | 0.908 | 0.235 |
| 2.594955531865147 | -0.854 | 0.919 | 0.207 |
| 2.598097124518736 | -0.856 | 0.93 | 0.179 |
| 2.601238717172326 | -0.858 | 0.941 | 0.151 |
| 2.604380309825915 | -0.859 | 0.952 | 0.122 |
| 2.607521902479505 | -0.861 | 0.964 | 0.094 |
| 2.610663495133095 | -0.862 | 0.975 | 0.066 |
| 2.613805087786684 | -0.864 | 0.985 | 0.038 |
| 2.616946680440274 | -0.866 | 0.996 | 0.009 |
| 2.620088273093863 | -0.867 | 1.007 | -0.019 |
| 2.623229865747452 | -0.869 | 1.018 | -0.047 |
| 2.626371458401042 | -0.87 | 1.029 | -0.075 |
| 2.629513051054632 | -0.872 | 1.04 | -0.104 |
| 2.632654643708222 | -0.873 | 1.05 | -0.132 |
| 2.635796236361811 | -0.875 | 1.061 | -0.16 |
| 2.638937829015401 | -0.876 | 1.072 | -0.188 |
| 2.642079421668991 | -0.878 | 1.082 | -0.217 |
| 2.64522101432258 | -0.879 | 1.093 | -0.245 |
| 2.64836260697617 | -0.881 | 1.103 | -0.273 |
| 2.651504199629759 | -0.882 | 1.114 | -0.301 |
| 2.654645792283349 | -0.884 | 1.124 | -0.329 |
| 2.657787384936938 | -0.885 | 1.135 | -0.357 |
| 2.660928977590528 | -0.887 | 1.145 | -0.385 |
| 2.664070570244118 | -0.888 | 1.155 | -0.413 |
| 2.667212162897707 | -0.89 | 1.165 | -0.441 |
| 2.670353755551297 | -0.891 | 1.176 | -0.469 |
| 2.673495348204887 | -0.892 | 1.186 | -0.497 |
| 2.676636940858476 | -0.894 | 1.196 | -0.525 |
| 2.679778533512066 | -0.895 | 1.206 | -0.553 |
| 2.682920126165655 | -0.897 | 1.216 | -0.581 |
| 2.686061718819245 | -0.898 | 1.226 | -0.608 |
| 2.689203311472835 | -0.899 | 1.236 | -0.636 |
| 2.692344904126424 | -0.901 | 1.246 | -0.664 |
| 2.695486496780014 | -0.902 | 1.255 | -0.691 |
| 2.698628089433603 | -0.903 | 1.265 | -0.719 |
| 2.701769682087193 | -0.905 | 1.275 | -0.746 |
| 2.704911274740782 | -0.906 | 1.285 | -0.773 |
| 2.708052867394372 | -0.907 | 1.294 | -0.801 |
| 2.711194460047962 | -0.909 | 1.304 | -0.828 |
| 2.714336052701551 | -0.91 | 1.313 | -0.855 |
| 2.717477645355141 | -0.911 | 1.323 | -0.882 |
| 2.720619238008731 | -0.913 | 1.332 | -0.909 |
| 2.72376083066232 | -0.914 | 1.341 | -0.936 |
| 2.72690242331591 | -0.915 | 1.351 | -0.963 |
| 2.730044015969499 | -0.917 | 1.36 | -0.99 |
| 2.733185608623089 | -0.918 | 1.369 | -1.016 |
| 2.736327201276678 | -0.919 | 1.378 | -1.043 |
| 2.739468793930268 | -0.92 | 1.387 | -1.069 |
| 2.742610386583858 | -0.921 | 1.396 | -1.096 |
| 2.745751979237447 | -0.923 | 1.405 | -1.122 |
| 2.748893571891036 | -0.924 | 1.414 | -1.148 |
| 2.752035164544627 | -0.925 | 1.423 | -1.174 |
| 2.755176757198216 | -0.926 | 1.432 | -1.2 |
| 2.758318349851806 | -0.927 | 1.441 | -1.226 |
| 2.761459942505395 | -0.929 | 1.449 | -1.252 |
| 2.764601535158985 | -0.93 | 1.458 | -1.277 |
| 2.767743127812574 | -0.931 | 1.467 | -1.303 |
| 2.770884720466164 | -0.932 | 1.475 | -1.328 |
| 2.774026313119754 | -0.933 | 1.483 | -1.354 |
| 2.777167905773343 | -0.934 | 1.492 | -1.379 |
| 2.780309498426932 | -0.935 | 1.5 | -1.404 |
| 2.783451091080522 | -0.937 | 1.509 | -1.429 |
| 2.786592683734112 | -0.938 | 1.517 | -1.454 |
| 2.789734276387701 | -0.939 | 1.525 | -1.478 |
| 2.792875869041291 | -0.94 | 1.533 | -1.503 |
| 2.796017461694881 | -0.941 | 1.541 | -1.527 |
| 2.79915905434847 | -0.942 | 1.549 | -1.551 |
| 2.80230064700206 | -0.943 | 1.557 | -1.576 |
| 2.80544223965565 | -0.944 | 1.565 | -1.6 |
| 2.808583832309239 | -0.945 | 1.573 | -1.623 |
| 2.811725424962829 | -0.946 | 1.58 | -1.647 |
| 2.814867017616419 | -0.947 | 1.588 | -1.671 |
| 2.818008610270008 | -0.948 | 1.596 | -1.694 |
| 2.821150202923598 | -0.949 | 1.603 | -1.717 |
| 2.824291795577187 | -0.95 | 1.611 | -1.74 |
| 2.827433388230777 | -0.951 | 1.618 | -1.763 |
| 2.830574980884366 | -0.952 | 1.625 | -1.786 |
| 2.833716573537956 | -0.953 | 1.633 | -1.809 |
| 2.836858166191546 | -0.954 | 1.64 | -1.831 |
| 2.839999758845135 | -0.955 | 1.647 | -1.854 |
| 2.843141351498725 | -0.956 | 1.654 | -1.876 |
| 2.846282944152314 | -0.957 | 1.661 | -1.898 |
| 2.849424536805904 | -0.958 | 1.668 | -1.92 |
| 2.852566129459494 | -0.959 | 1.675 | -1.941 |
| 2.855707722113083 | -0.959 | 1.682 | -1.963 |
| 2.858849314766673 | -0.96 | 1.689 | -1.984 |
| 2.861990907420262 | -0.961 | 1.695 | -2.005 |
| 2.865132500073852 | -0.962 | 1.702 | -2.026 |
| 2.868274092727442 | -0.963 | 1.709 | -2.047 |
| 2.871415685381031 | -0.964 | 1.715 | -2.067 |
| 2.874557278034621 | -0.965 | 1.721 | -2.088 |
| 2.87769887068821 | -0.965 | 1.728 | -2.108 |
| 2.8808404633418 | -0.966 | 1.734 | -2.128 |
| 2.88398205599539 | -0.967 | 1.74 | -2.148 |
| 2.88712364864898 | -0.968 | 1.747 | -2.167 |
| 2.890265241302569 | -0.969 | 1.753 | -2.187 |
| 2.893406833956158 | -0.969 | 1.759 | -2.206 |
| 2.896548426609748 | -0.97 | 1.765 | -2.225 |
| 2.899690019263338 | -0.971 | 1.77 | -2.244 |
| 2.902831611916927 | -0.972 | 1.776 | -2.263 |
| 2.905973204570517 | -0.972 | 1.782 | -2.281 |
| 2.909114797224106 | -0.973 | 1.788 | -2.299 |
| 2.912256389877696 | -0.974 | 1.793 | -2.318 |
| 2.915397982531286 | -0.975 | 1.799 | -2.335 |
| 2.918539575184875 | -0.975 | 1.804 | -2.353 |
| 2.921681167838465 | -0.976 | 1.81 | -2.37 |
| 2.924822760492054 | -0.977 | 1.815 | -2.388 |
| 2.927964353145644 | -0.977 | 1.82 | -2.405 |
| 2.931105945799234 | -0.978 | 1.825 | -2.421 |
| 2.934247538452823 | -0.979 | 1.83 | -2.438 |
| 2.937389131106413 | -0.979 | 1.836 | -2.454 |
| 2.940530723760002 | -0.98 | 1.84 | -2.471 |
| 2.943672316413592 | -0.98 | 1.845 | -2.487 |
| 2.946813909067182 | -0.981 | 1.85 | -2.502 |
| 2.949955501720771 | -0.982 | 1.855 | -2.518 |
| 2.953097094374361 | -0.982 | 1.86 | -2.533 |
| 2.95623868702795 | -0.983 | 1.864 | -2.548 |
| 2.95938027968154 | -0.983 | 1.869 | -2.563 |
| 2.96252187233513 | -0.984 | 1.873 | -2.577 |
| 2.965663464988719 | -0.985 | 1.877 | -2.592 |
| 2.968805057642309 | -0.985 | 1.882 | -2.606 |
| 2.971946650295898 | -0.986 | 1.886 | -2.62 |
| 2.975088242949488 | -0.986 | 1.89 | -2.633 |
| 2.978229835603078 | -0.987 | 1.894 | -2.647 |
| 2.981371428256667 | -0.987 | 1.898 | -2.66 |
| 2.984513020910257 | -0.988 | 1.902 | -2.673 |
| 2.987654613563846 | -0.988 | 1.906 | -2.686 |
| 2.990796206217436 | -0.989 | 1.91 | -2.698 |
| 2.993937798871025 | -0.989 | 1.913 | -2.71 |
| 2.997079391524615 | -0.99 | 1.917 | -2.722 |
| 3.000220984178205 | -0.99 | 1.921 | -2.734 |
| 3.003362576831794 | -0.99 | 1.924 | -2.746 |
| 3.006504169485384 | -0.991 | 1.927 | -2.757 |
| 3.009645762138974 | -0.991 | 1.931 | -2.768 |
| 3.012787354792563 | -0.992 | 1.934 | -2.779 |
| 3.015928947446153 | -0.992 | 1.937 | -2.789 |
| 3.019070540099742 | -0.993 | 1.94 | -2.8 |
| 3.022212132753332 | -0.993 | 1.943 | -2.81 |
| 3.025353725406922 | -0.993 | 1.946 | -2.819 |
| 3.028495318060511 | -0.994 | 1.949 | -2.829 |
| 3.031636910714101 | -0.994 | 1.952 | -2.838 |
| 3.03477850336769 | -0.994 | 1.955 | -2.847 |
| 3.03792009602128 | -0.995 | 1.957 | -2.856 |
| 3.04106168867487 | -0.995 | 1.96 | -2.865 |
| 3.04420328132846 | -0.995 | 1.962 | -2.873 |
| 3.047344873982049 | -0.996 | 1.965 | -2.881 |
| 3.050486466635638 | -0.996 | 1.967 | -2.889 |
| 3.053628059289228 | -0.996 | 1.969 | -2.896 |
| 3.056769651942818 | -0.996 | 1.971 | -2.903 |
| 3.059911244596407 | -0.997 | 1.973 | -2.91 |
| 3.063052837249997 | -0.997 | 1.975 | -2.917 |
| 3.066194429903586 | -0.997 | 1.977 | -2.924 |
| 3.069336022557176 | -0.997 | 1.979 | -2.93 |
| 3.072477615210766 | -0.998 | 1.981 | -2.936 |
| 3.075619207864355 | -0.998 | 1.983 | -2.941 |
| 3.078760800517945 | -0.998 | 1.984 | -2.947 |
| 3.081902393171534 | -0.998 | 1.986 | -2.952 |
| 3.085043985825124 | -0.998 | 1.987 | -2.957 |
| 3.088185578478713 | -0.999 | 1.989 | -2.962 |
| 3.091327171132303 | -0.999 | 1.99 | -2.966 |
| 3.094468763785893 | -0.999 | 1.991 | -2.97 |
| 3.097610356439482 | -0.999 | 1.992 | -2.974 |
| 3.100751949093072 | -0.999 | 1.993 | -2.978 |
| 3.103893541746661 | -0.999 | 1.994 | -2.981 |
| 3.107035134400251 | -0.999 | 1.995 | -2.984 |
| 3.110176727053841 | -1 | 1.996 | -2.987 |
| 3.11331831970743 | -1 | 1.997 | -2.989 |
| 3.11645991236102 | -1 | 1.997 | -2.991 |
| 3.11960150501461 | -1 | 1.998 | -2.993 |
| 3.122743097668199 | -1 | 1.999 | -2.995 |
| 3.125884690321789 | -1 | 1.999 | -2.997 |
| 3.129026282975378 | -1 | 1.999 | -2.998 |
| 3.132167875628968 | -1 | 2 | -2.999 |
| 3.135309468282557 | -1 | 2 | -2.999 |
| 3.138451060936147 | -1 | 2 | -3 |
| 3.141592653589737 | -1 | 2 | -3 |
| 3.144734246243326 | -1 | 2 | -3 |
| 3.147875838896916 | -1 | 2 | -2.999 |
| 3.151017431550505 | -1 | 2 | -2.999 |
| 3.154159024204095 | -1 | 1.999 | -2.998 |
| 3.157300616857685 | -1 | 1.999 | -2.997 |
| 3.160442209511274 | -1 | 1.999 | -2.995 |
| 3.163583802164864 | -1 | 1.998 | -2.993 |
| 3.166725394818453 | -1 | 1.997 | -2.991 |
| 3.169866987472043 | -1 | 1.997 | -2.989 |
| 3.173008580125633 | -1 | 1.996 | -2.987 |
| 3.176150172779222 | -0.999 | 1.995 | -2.984 |
| 3.179291765432812 | -0.999 | 1.994 | -2.981 |
| 3.182433358086401 | -0.999 | 1.993 | -2.978 |
| 3.185574950739991 | -0.999 | 1.992 | -2.974 |
| 3.188716543393581 | -0.999 | 1.991 | -2.97 |
| 3.19185813604717 | -0.999 | 1.99 | -2.966 |
| 3.19499972870076 | -0.999 | 1.989 | -2.962 |
| 3.198141321354349 | -0.998 | 1.987 | -2.957 |
| 3.20128291400794 | -0.998 | 1.986 | -2.952 |
| 3.204424506661528 | -0.998 | 1.984 | -2.947 |
| 3.207566099315118 | -0.998 | 1.983 | -2.941 |
| 3.210707691968708 | -0.998 | 1.981 | -2.936 |
| 3.213849284622297 | -0.997 | 1.979 | -2.93 |
| 3.216990877275887 | -0.997 | 1.977 | -2.924 |
| 3.220132469929476 | -0.997 | 1.975 | -2.917 |
| 3.223274062583066 | -0.997 | 1.973 | -2.91 |
| 3.226415655236656 | -0.996 | 1.971 | -2.903 |
| 3.229557247890245 | -0.996 | 1.969 | -2.896 |
| 3.232698840543835 | -0.996 | 1.967 | -2.889 |
| 3.235840433197425 | -0.996 | 1.965 | -2.881 |
| 3.238982025851014 | -0.995 | 1.962 | -2.873 |
| 3.242123618504604 | -0.995 | 1.96 | -2.865 |
| 3.245265211158193 | -0.995 | 1.957 | -2.856 |
| 3.248406803811783 | -0.994 | 1.955 | -2.847 |
| 3.251548396465373 | -0.994 | 1.952 | -2.838 |
| 3.254689989118962 | -0.994 | 1.949 | -2.829 |
| 3.257831581772551 | -0.993 | 1.946 | -2.819 |
| 3.260973174426141 | -0.993 | 1.943 | -2.81 |
| 3.26411476707973 | -0.993 | 1.94 | -2.8 |
| 3.267256359733321 | -0.992 | 1.937 | -2.789 |
| 3.27039795238691 | -0.992 | 1.934 | -2.779 |
| 3.2735395450405 | -0.991 | 1.931 | -2.768 |
| 3.276681137694089 | -0.991 | 1.927 | -2.757 |
| 3.279822730347679 | -0.99 | 1.924 | -2.746 |
| 3.282964323001269 | -0.99 | 1.921 | -2.734 |
| 3.286105915654858 | -0.99 | 1.917 | -2.722 |
| 3.289247508308448 | -0.989 | 1.913 | -2.71 |
| 3.292389100962037 | -0.989 | 1.91 | -2.698 |
| 3.295530693615627 | -0.988 | 1.906 | -2.686 |
| 3.298672286269217 | -0.988 | 1.902 | -2.673 |
| 3.301813878922806 | -0.987 | 1.898 | -2.66 |
| 3.304955471576396 | -0.987 | 1.894 | -2.647 |
| 3.308097064229985 | -0.986 | 1.89 | -2.633 |
| 3.311238656883575 | -0.986 | 1.886 | -2.62 |
| 3.314380249537165 | -0.985 | 1.882 | -2.606 |
| 3.317521842190754 | -0.985 | 1.877 | -2.592 |
| 3.320663434844344 | -0.984 | 1.873 | -2.577 |
| 3.323805027497933 | -0.983 | 1.869 | -2.563 |
| 3.326946620151523 | -0.983 | 1.864 | -2.548 |
| 3.330088212805113 | -0.982 | 1.86 | -2.533 |
| 3.333229805458702 | -0.982 | 1.855 | -2.518 |
| 3.336371398112292 | -0.981 | 1.85 | -2.502 |
| 3.339512990765881 | -0.98 | 1.845 | -2.487 |
| 3.342654583419471 | -0.98 | 1.84 | -2.471 |
| 3.345796176073061 | -0.979 | 1.836 | -2.454 |
| 3.34893776872665 | -0.979 | 1.83 | -2.438 |
| 3.35207936138024 | -0.978 | 1.825 | -2.421 |
| 3.355220954033829 | -0.977 | 1.82 | -2.405 |
| 3.358362546687419 | -0.977 | 1.815 | -2.388 |
| 3.361504139341009 | -0.976 | 1.81 | -2.37 |
| 3.364645731994598 | -0.975 | 1.804 | -2.353 |
| 3.367787324648188 | -0.975 | 1.799 | -2.335 |
| 3.370928917301777 | -0.974 | 1.793 | -2.318 |
| 3.374070509955367 | -0.973 | 1.788 | -2.299 |
| 3.377212102608956 | -0.972 | 1.782 | -2.281 |
| 3.380353695262546 | -0.972 | 1.776 | -2.263 |
| 3.383495287916136 | -0.971 | 1.77 | -2.244 |
| 3.386636880569725 | -0.97 | 1.765 | -2.225 |
| 3.389778473223315 | -0.969 | 1.759 | -2.206 |
| 3.392920065876904 | -0.969 | 1.753 | -2.187 |
| 3.396061658530494 | -0.968 | 1.747 | -2.167 |
| 3.399203251184084 | -0.967 | 1.74 | -2.148 |
| 3.402344843837673 | -0.966 | 1.734 | -2.128 |
| 3.405486436491263 | -0.965 | 1.728 | -2.108 |
| 3.408628029144852 | -0.965 | 1.721 | -2.088 |
| 3.411769621798442 | -0.964 | 1.715 | -2.067 |
| 3.414911214452032 | -0.963 | 1.709 | -2.047 |
| 3.418052807105621 | -0.962 | 1.702 | -2.026 |
| 3.421194399759211 | -0.961 | 1.695 | -2.005 |
| 3.4243359924128 | -0.96 | 1.689 | -1.984 |
| 3.42747758506639 | -0.959 | 1.682 | -1.963 |
| 3.43061917771998 | -0.959 | 1.675 | -1.941 |
| 3.433760770373569 | -0.958 | 1.668 | -1.92 |
| 3.436902363027159 | -0.957 | 1.661 | -1.898 |
| 3.440043955680748 | -0.956 | 1.654 | -1.876 |
| 3.443185548334338 | -0.955 | 1.647 | -1.854 |
| 3.446327140987927 | -0.954 | 1.64 | -1.831 |
| 3.449468733641517 | -0.953 | 1.633 | -1.809 |
| 3.452610326295107 | -0.952 | 1.625 | -1.786 |
| 3.455751918948696 | -0.951 | 1.618 | -1.763 |
| 3.458893511602286 | -0.95 | 1.611 | -1.74 |
| 3.462035104255876 | -0.949 | 1.603 | -1.717 |
| 3.465176696909465 | -0.948 | 1.596 | -1.694 |
| 3.468318289563055 | -0.947 | 1.588 | -1.671 |
| 3.471459882216644 | -0.946 | 1.58 | -1.647 |
| 3.474601474870234 | -0.945 | 1.573 | -1.623 |
| 3.477743067523824 | -0.944 | 1.565 | -1.6 |
| 3.480884660177413 | -0.943 | 1.557 | -1.576 |
| 3.484026252831002 | -0.942 | 1.549 | -1.551 |
| 3.487167845484592 | -0.941 | 1.541 | -1.527 |
| 3.490309438138182 | -0.94 | 1.533 | -1.503 |
| 3.493451030791772 | -0.939 | 1.525 | -1.478 |
| 3.496592623445361 | -0.938 | 1.517 | -1.454 |
| 3.499734216098951 | -0.937 | 1.509 | -1.429 |
| 3.50287580875254 | -0.935 | 1.5 | -1.404 |
| 3.50601740140613 | -0.934 | 1.492 | -1.379 |
| 3.50915899405972 | -0.933 | 1.483 | -1.354 |
| 3.512300586713309 | -0.932 | 1.475 | -1.328 |
| 3.515442179366899 | -0.931 | 1.467 | -1.303 |
| 3.518583772020488 | -0.93 | 1.458 | -1.277 |
| 3.521725364674078 | -0.929 | 1.449 | -1.252 |
| 3.524866957327668 | -0.927 | 1.441 | -1.226 |
| 3.528008549981257 | -0.926 | 1.432 | -1.2 |
| 3.531150142634847 | -0.925 | 1.423 | -1.174 |
| 3.534291735288436 | -0.924 | 1.414 | -1.148 |
| 3.537433327942026 | -0.923 | 1.405 | -1.122 |
| 3.540574920595616 | -0.921 | 1.396 | -1.096 |
| 3.543716513249205 | -0.92 | 1.387 | -1.069 |
| 3.546858105902795 | -0.919 | 1.378 | -1.043 |
| 3.549999698556384 | -0.918 | 1.369 | -1.016 |
| 3.553141291209974 | -0.917 | 1.36 | -0.99 |
| 3.556282883863564 | -0.915 | 1.351 | -0.963 |
| 3.559424476517153 | -0.914 | 1.341 | -0.936 |
| 3.562566069170743 | -0.913 | 1.332 | -0.909 |
| 3.565707661824332 | -0.911 | 1.323 | -0.882 |
| 3.568849254477922 | -0.91 | 1.313 | -0.855 |
| 3.571990847131511 | -0.909 | 1.304 | -0.828 |
| 3.575132439785101 | -0.907 | 1.294 | -0.801 |
| 3.578274032438691 | -0.906 | 1.285 | -0.773 |
| 3.58141562509228 | -0.905 | 1.275 | -0.746 |
| 3.58455721774587 | -0.903 | 1.265 | -0.719 |
| 3.58769881039946 | -0.902 | 1.255 | -0.691 |
| 3.590840403053049 | -0.901 | 1.246 | -0.664 |
| 3.593981995706639 | -0.899 | 1.236 | -0.636 |
| 3.597123588360228 | -0.898 | 1.226 | -0.608 |
| 3.600265181013818 | -0.897 | 1.216 | -0.581 |
| 3.603406773667407 | -0.895 | 1.206 | -0.553 |
| 3.606548366320997 | -0.894 | 1.196 | -0.525 |
| 3.609689958974587 | -0.892 | 1.186 | -0.497 |
| 3.612831551628176 | -0.891 | 1.176 | -0.469 |
| 3.615973144281766 | -0.89 | 1.165 | -0.441 |
| 3.619114736935355 | -0.888 | 1.155 | -0.413 |
| 3.622256329588945 | -0.887 | 1.145 | -0.385 |
| 3.625397922242534 | -0.885 | 1.135 | -0.357 |
| 3.628539514896124 | -0.884 | 1.124 | -0.329 |
| 3.631681107549714 | -0.882 | 1.114 | -0.301 |
| 3.634822700203303 | -0.881 | 1.103 | -0.273 |
| 3.637964292856893 | -0.879 | 1.093 | -0.245 |
| 3.641105885510483 | -0.878 | 1.082 | -0.217 |
| 3.644247478164072 | -0.876 | 1.072 | -0.188 |
| 3.647389070817662 | -0.875 | 1.061 | -0.16 |
| 3.650530663471251 | -0.873 | 1.05 | -0.132 |
| 3.653672256124841 | -0.872 | 1.04 | -0.104 |
| 3.656813848778431 | -0.87 | 1.029 | -0.075 |
| 3.65995544143202 | -0.869 | 1.018 | -0.047 |
| 3.66309703408561 | -0.867 | 1.007 | -0.019 |
| 3.666238626739199 | -0.866 | 0.996 | 0.009 |
| 3.66938021939279 | -0.864 | 0.985 | 0.038 |
| 3.672521812046378 | -0.862 | 0.975 | 0.066 |
| 3.675663404699968 | -0.861 | 0.964 | 0.094 |
| 3.678804997353558 | -0.859 | 0.952 | 0.122 |
| 3.681946590007147 | -0.858 | 0.941 | 0.151 |
| 3.685088182660737 | -0.856 | 0.93 | 0.179 |
| 3.688229775314326 | -0.854 | 0.919 | 0.207 |
| 3.691371367967916 | -0.853 | 0.908 | 0.235 |
| 3.694512960621506 | -0.851 | 0.897 | 0.264 |
| 3.697654553275095 | -0.849 | 0.886 | 0.292 |
| 3.700796145928685 | -0.848 | 0.874 | 0.32 |
| 3.703937738582274 | -0.846 | 0.863 | 0.348 |
| 3.707079331235864 | -0.844 | 0.852 | 0.376 |
| 3.710220923889454 | -0.843 | 0.84 | 0.404 |
| 3.713362516543043 | -0.841 | 0.829 | 0.432 |
| 3.716504109196633 | -0.839 | 0.817 | 0.46 |
| 3.719645701850223 | -0.838 | 0.806 | 0.488 |
| 3.722787294503812 | -0.836 | 0.794 | 0.516 |
| 3.725928887157402 | -0.834 | 0.783 | 0.544 |
| 3.729070479810991 | -0.832 | 0.771 | 0.571 |
| 3.732212072464581 | -0.831 | 0.76 | 0.599 |
| 3.735353665118171 | -0.829 | 0.748 | 0.627 |
| 3.73849525777176 | -0.827 | 0.736 | 0.654 |
| 3.74163685042535 | -0.825 | 0.725 | 0.682 |
| 3.744778443078939 | -0.824 | 0.713 | 0.709 |
| 3.747920035732529 | -0.822 | 0.701 | 0.737 |
| 3.751061628386119 | -0.82 | 0.689 | 0.764 |
| 3.754203221039708 | -0.818 | 0.677 | 0.792 |
| 3.757344813693298 | -0.816 | 0.666 | 0.819 |
| 3.760486406346887 | -0.815 | 0.654 | 0.846 |
| 3.763627999000477 | -0.813 | 0.642 | 0.873 |
| 3.766769591654067 | -0.811 | 0.63 | 0.9 |
| 3.769911184307656 | -0.809 | 0.618 | 0.927 |
| 3.773052776961246 | -0.807 | 0.606 | 0.954 |
| 3.776194369614835 | -0.805 | 0.594 | 0.981 |
| 3.779335962268425 | -0.803 | 0.582 | 1.007 |
| 3.782477554922014 | -0.802 | 0.57 | 1.034 |
| 3.785619147575604 | -0.8 | 0.558 | 1.06 |
| 3.788760740229193 | -0.798 | 0.546 | 1.087 |
| 3.791902332882783 | -0.796 | 0.534 | 1.113 |
| 3.795043925536373 | -0.794 | 0.522 | 1.139 |
| 3.798185518189962 | -0.792 | 0.51 | 1.165 |
| 3.801327110843552 | -0.79 | 0.497 | 1.191 |
| 3.804468703497142 | -0.788 | 0.485 | 1.217 |
| 3.807610296150731 | -0.786 | 0.473 | 1.243 |
| 3.810751888804321 | -0.784 | 0.461 | 1.269 |
| 3.813893481457911 | -0.782 | 0.449 | 1.294 |
| 3.8170350741115 | -0.78 | 0.436 | 1.32 |
| 3.82017666676509 | -0.778 | 0.424 | 1.345 |
| 3.823318259418679 | -0.776 | 0.412 | 1.37 |
| 3.826459852072269 | -0.775 | 0.399 | 1.395 |
| 3.829601444725859 | -0.773 | 0.387 | 1.42 |
| 3.832743037379448 | -0.771 | 0.375 | 1.445 |
| 3.835884630033038 | -0.769 | 0.362 | 1.47 |
| 3.839026222686627 | -0.766 | 0.35 | 1.495 |
| 3.842167815340217 | -0.764 | 0.338 | 1.519 |
| 3.845309407993807 | -0.762 | 0.325 | 1.543 |
| 3.848451000647396 | -0.76 | 0.313 | 1.567 |
| 3.851592593300986 | -0.758 | 0.3 | 1.592 |
| 3.854734185954575 | -0.756 | 0.288 | 1.615 |
| 3.857875778608165 | -0.754 | 0.276 | 1.639 |
| 3.861017371261755 | -0.752 | 0.263 | 1.663 |
| 3.864158963915344 | -0.75 | 0.251 | 1.686 |
| 3.867300556568933 | -0.748 | 0.238 | 1.71 |
| 3.870442149222523 | -0.746 | 0.226 | 1.733 |
| 3.873583741876112 | -0.744 | 0.213 | 1.756 |
| 3.876725334529703 | -0.742 | 0.201 | 1.779 |
| 3.879866927183292 | -0.74 | 0.188 | 1.801 |
| 3.883008519836882 | -0.738 | 0.176 | 1.824 |
| 3.886150112490471 | -0.735 | 0.163 | 1.846 |
| 3.889291705144061 | -0.733 | 0.151 | 1.868 |
| 3.892433297797651 | -0.731 | 0.138 | 1.89 |
| 3.89557489045124 | -0.729 | 0.126 | 1.912 |
| 3.89871648310483 | -0.727 | 0.113 | 1.934 |
| 3.901858075758419 | -0.725 | 0.1 | 1.956 |
| 3.904999668412009 | -0.722 | 0.088 | 1.977 |
| 3.908141261065598 | -0.72 | 0.075 | 1.998 |
| 3.911282853719188 | -0.718 | 0.063 | 2.019 |
| 3.914424446372778 | -0.716 | 0.05 | 2.04 |
| 3.917566039026367 | -0.714 | 0.038 | 2.061 |
| 3.920707631679957 | -0.712 | 0.025 | 2.081 |
| 3.923849224333547 | -0.709 | 0.013 | 2.101 |
| 3.926990816987136 | -0.707 | 0 | 2.121 |
| 3.930132409640726 | -0.705 | -0.013 | 2.141 |
| 3.933274002294315 | -0.703 | -0.025 | 2.161 |
| 3.936415594947905 | -0.7 | -0.038 | 2.18 |
| 3.939557187601495 | -0.698 | -0.05 | 2.2 |
| 3.942698780255084 | -0.696 | -0.063 | 2.219 |
| 3.945840372908674 | -0.694 | -0.075 | 2.238 |
| 3.948981965562263 | -0.691 | -0.088 | 2.257 |
| 3.952123558215853 | -0.689 | -0.1 | 2.275 |
| 3.955265150869442 | -0.687 | -0.113 | 2.293 |
| 3.958406743523032 | -0.685 | -0.126 | 2.312 |
| 3.961548336176622 | -0.682 | -0.138 | 2.329 |
| 3.964689928830211 | -0.68 | -0.151 | 2.347 |
| 3.967831521483801 | -0.678 | -0.163 | 2.365 |
| 3.97097311413739 | -0.675 | -0.176 | 2.382 |
| 3.97411470679098 | -0.673 | -0.188 | 2.399 |
| 3.97725629944457 | -0.671 | -0.201 | 2.416 |
| 3.98039789209816 | -0.668 | -0.213 | 2.433 |
| 3.983539484751749 | -0.666 | -0.226 | 2.449 |
| 3.986681077405338 | -0.664 | -0.238 | 2.465 |
| 3.989822670058928 | -0.661 | -0.251 | 2.481 |
| 3.992964262712517 | -0.659 | -0.263 | 2.497 |
| 3.996105855366107 | -0.657 | -0.276 | 2.513 |
| 3.999247448019697 | -0.654 | -0.288 | 2.528 |
| 4.002389040673287 | -0.652 | -0.3 | 2.543 |
| 4.005530633326877 | -0.649 | -0.313 | 2.558 |
| 4.008672225980466 | -0.647 | -0.325 | 2.573 |
| 4.011813818634056 | -0.645 | -0.338 | 2.587 |
| 4.014955411287645 | -0.642 | -0.35 | 2.601 |
| 4.018097003941234 | -0.64 | -0.362 | 2.615 |
| 4.021238596594824 | -0.637 | -0.375 | 2.629 |
| 4.024380189248414 | -0.635 | -0.387 | 2.642 |
| 4.027521781902004 | -0.633 | -0.399 | 2.656 |
| 4.030663374555593 | -0.63 | -0.412 | 2.669 |
| 4.033804967209183 | -0.628 | -0.424 | 2.682 |
| 4.036946559862773 | -0.625 | -0.436 | 2.694 |
| 4.040088152516362 | -0.623 | -0.449 | 2.706 |
| 4.043229745169951 | -0.62 | -0.461 | 2.718 |
| 4.046371337823541 | -0.618 | -0.473 | 2.73 |
| 4.049512930477131 | -0.615 | -0.485 | 2.742 |
| 4.05265452313072 | -0.613 | -0.497 | 2.753 |
| 4.05579611578431 | -0.61 | -0.51 | 2.764 |
| 4.0589377084379 | -0.608 | -0.522 | 2.775 |
| 4.062079301091489 | -0.605 | -0.534 | 2.786 |
| 4.065220893745079 | -0.603 | -0.546 | 2.796 |
| 4.068362486398668 | -0.6 | -0.558 | 2.806 |
| 4.071504079052258 | -0.598 | -0.57 | 2.816 |
| 4.074645671705848 | -0.595 | -0.582 | 2.826 |
| 4.077787264359437 | -0.593 | -0.594 | 2.835 |
| 4.080928857013027 | -0.59 | -0.606 | 2.844 |
| 4.084070449666616 | -0.588 | -0.618 | 2.853 |
| 4.087212042320206 | -0.585 | -0.63 | 2.862 |
| 4.090353634973795 | -0.583 | -0.642 | 2.87 |
| 4.093495227627385 | -0.58 | -0.654 | 2.878 |
| 4.096636820280975 | -0.578 | -0.666 | 2.886 |
| 4.099778412934564 | -0.575 | -0.677 | 2.894 |
| 4.102920005588154 | -0.572 | -0.689 | 2.901 |
| 4.106061598241744 | -0.57 | -0.701 | 2.908 |
| 4.109203190895333 | -0.567 | -0.713 | 2.915 |
| 4.112344783548923 | -0.565 | -0.725 | 2.921 |
| 4.115486376202512 | -0.562 | -0.736 | 2.928 |
| 4.118627968856102 | -0.559 | -0.748 | 2.934 |
| 4.121769561509692 | -0.557 | -0.76 | 2.94 |
| 4.124911154163281 | -0.554 | -0.771 | 2.945 |
| 4.128052746816871 | -0.552 | -0.783 | 2.95 |
| 4.13119433947046 | -0.549 | -0.794 | 2.955 |
| 4.13433593212405 | -0.546 | -0.806 | 2.96 |
| 4.13747752477764 | -0.544 | -0.817 | 2.965 |
| 4.14061911743123 | -0.541 | -0.829 | 2.969 |
| 4.143760710084818 | -0.538 | -0.84 | 2.973 |
| 4.146902302738408 | -0.536 | -0.852 | 2.976 |
| 4.150043895391998 | -0.533 | -0.863 | 2.98 |
| 4.153185488045588 | -0.531 | -0.874 | 2.983 |
| 4.156327080699177 | -0.528 | -0.886 | 2.986 |
| 4.159468673352766 | -0.525 | -0.897 | 2.988 |
| 4.162610266006356 | -0.522 | -0.908 | 2.991 |
| 4.165751858659946 | -0.52 | -0.919 | 2.993 |
| 4.168893451313535 | -0.517 | -0.93 | 2.995 |
| 4.172035043967125 | -0.514 | -0.941 | 2.996 |
| 4.175176636620715 | -0.512 | -0.952 | 2.997 |
| 4.178318229274304 | -0.509 | -0.964 | 2.999 |
| 4.181459821927894 | -0.506 | -0.975 | 2.999 |
| 4.184601414581484 | -0.504 | -0.985 | 3 |
| 4.187743007235073 | -0.501 | -0.996 | 3 |
| 4.190884599888663 | -0.498 | -1.007 | 3 |
| 4.194026192542252 | -0.495 | -1.018 | 3 |
| 4.197167785195842 | -0.493 | -1.029 | 2.999 |
| 4.200309377849432 | -0.49 | -1.04 | 2.998 |
| 4.203450970503021 | -0.487 | -1.05 | 2.997 |
| 4.206592563156611 | -0.485 | -1.061 | 2.996 |
| 4.2097341558102 | -0.482 | -1.072 | 2.994 |
| 4.21287574846379 | -0.479 | -1.082 | 2.992 |
| 4.21601734111738 | -0.476 | -1.093 | 2.99 |
| 4.21915893377097 | -0.473 | -1.103 | 2.988 |
| 4.222300526424559 | -0.471 | -1.114 | 2.985 |
| 4.225442119078148 | -0.468 | -1.124 | 2.982 |
| 4.228583711731738 | -0.465 | -1.135 | 2.979 |
| 4.231725304385327 | -0.462 | -1.145 | 2.975 |
| 4.234866897038917 | -0.46 | -1.155 | 2.971 |
| 4.238008489692506 | -0.457 | -1.165 | 2.967 |
| 4.241150082346096 | -0.454 | -1.176 | 2.963 |
| 4.244291674999685 | -0.451 | -1.186 | 2.959 |
| 4.247433267653276 | -0.448 | -1.196 | 2.954 |
| 4.250574860306865 | -0.446 | -1.206 | 2.949 |
| 4.253716452960455 | -0.443 | -1.216 | 2.943 |
| 4.256858045614044 | -0.44 | -1.226 | 2.938 |
| 4.259999638267634 | -0.437 | -1.236 | 2.932 |
| 4.263141230921224 | -0.434 | -1.246 | 2.926 |
| 4.266282823574813 | -0.431 | -1.255 | 2.919 |
| 4.269424416228403 | -0.429 | -1.265 | 2.913 |
| 4.272566008881992 | -0.426 | -1.275 | 2.906 |
| 4.275707601535582 | -0.423 | -1.285 | 2.899 |
| 4.27884919418917 | -0.42 | -1.294 | 2.891 |
| 4.28199078684276 | -0.417 | -1.304 | 2.883 |
| 4.285132379496351 | -0.414 | -1.313 | 2.876 |
| 4.28827397214994 | -0.412 | -1.323 | 2.867 |
| 4.29141556480353 | -0.409 | -1.332 | 2.859 |
| 4.294557157457119 | -0.406 | -1.341 | 2.85 |
| 4.29769875011071 | -0.403 | -1.351 | 2.841 |
| 4.300840342764299 | -0.4 | -1.36 | 2.832 |
| 4.303981935417888 | -0.397 | -1.369 | 2.823 |
| 4.307123528071478 | -0.394 | -1.378 | 2.813 |
| 4.310265120725067 | -0.391 | -1.387 | 2.803 |
| 4.313406713378657 | -0.388 | -1.396 | 2.793 |
| 4.316548306032247 | -0.386 | -1.405 | 2.782 |
| 4.319689898685836 | -0.383 | -1.414 | 2.772 |
| 4.322831491339426 | -0.38 | -1.423 | 2.761 |
| 4.325973083993015 | -0.377 | -1.432 | 2.75 |
| 4.329114676646605 | -0.374 | -1.441 | 2.738 |
| 4.332256269300195 | -0.371 | -1.449 | 2.726 |
| 4.335397861953784 | -0.368 | -1.458 | 2.714 |
| 4.338539454607374 | -0.365 | -1.467 | 2.702 |
| 4.341681047260963 | -0.362 | -1.475 | 2.69 |
| 4.344822639914553 | -0.359 | -1.483 | 2.677 |
| 4.347964232568143 | -0.356 | -1.492 | 2.664 |
| 4.351105825221732 | -0.353 | -1.5 | 2.651 |
| 4.354247417875322 | -0.351 | -1.509 | 2.638 |
| 4.357389010528911 | -0.348 | -1.517 | 2.624 |
| 4.360530603182501 | -0.345 | -1.525 | 2.611 |
| 4.36367219583609 | -0.342 | -1.533 | 2.597 |
| 4.36681378848968 | -0.339 | -1.541 | 2.582 |
| 4.36995538114327 | -0.336 | -1.549 | 2.568 |
| 4.373096973796859 | -0.333 | -1.557 | 2.553 |
| 4.376238566450449 | -0.33 | -1.565 | 2.538 |
| 4.379380159104038 | -0.327 | -1.573 | 2.523 |
| 4.382521751757628 | -0.324 | -1.58 | 2.507 |
| 4.385663344411217 | -0.321 | -1.588 | 2.492 |
| 4.388804937064807 | -0.318 | -1.596 | 2.476 |
| 4.391946529718397 | -0.315 | -1.603 | 2.46 |
| 4.395088122371987 | -0.312 | -1.611 | 2.444 |
| 4.398229715025576 | -0.309 | -1.618 | 2.427 |
| 4.401371307679165 | -0.306 | -1.625 | 2.41 |
| 4.404512900332755 | -0.303 | -1.633 | 2.393 |
| 4.407654492986345 | -0.3 | -1.64 | 2.376 |
| 4.410796085639934 | -0.297 | -1.647 | 2.359 |
| 4.413937678293524 | -0.294 | -1.654 | 2.341 |
| 4.417079270947114 | -0.291 | -1.661 | 2.324 |
| 4.420220863600703 | -0.288 | -1.668 | 2.306 |
| 4.423362456254293 | -0.285 | -1.675 | 2.287 |
| 4.426504048907883 | -0.282 | -1.682 | 2.269 |
| 4.429645641561472 | -0.279 | -1.689 | 2.25 |
| 4.432787234215062 | -0.276 | -1.695 | 2.232 |
| 4.435928826868651 | -0.273 | -1.702 | 2.213 |
| 4.43907041952224 | -0.27 | -1.709 | 2.193 |
| 4.44221201217583 | -0.267 | -1.715 | 2.174 |
| 4.44535360482942 | -0.264 | -1.721 | 2.154 |
| 4.44849519748301 | -0.261 | -1.728 | 2.135 |
| 4.4516367901366 | -0.258 | -1.734 | 2.115 |
| 4.454778382790188 | -0.255 | -1.74 | 2.094 |
| 4.457919975443779 | -0.252 | -1.747 | 2.074 |
| 4.461061568097368 | -0.249 | -1.753 | 2.054 |
| 4.464203160750958 | -0.246 | -1.759 | 2.033 |
| 4.467344753404547 | -0.243 | -1.765 | 2.012 |
| 4.470486346058137 | -0.24 | -1.77 | 1.991 |
| 4.473627938711726 | -0.236 | -1.776 | 1.97 |
| 4.476769531365316 | -0.233 | -1.782 | 1.948 |
| 4.479911124018905 | -0.23 | -1.788 | 1.927 |
| 4.483052716672495 | -0.227 | -1.793 | 1.905 |
| 4.486194309326085 | -0.224 | -1.799 | 1.883 |
| 4.489335901979674 | -0.221 | -1.804 | 1.861 |
| 4.492477494633264 | -0.218 | -1.81 | 1.839 |
| 4.495619087286854 | -0.215 | -1.815 | 1.816 |
| 4.498760679940443 | -0.212 | -1.82 | 1.794 |
| 4.501902272594033 | -0.209 | -1.825 | 1.771 |
| 4.505043865247622 | -0.206 | -1.83 | 1.748 |
| 4.508185457901212 | -0.203 | -1.836 | 1.725 |
| 4.511327050554801 | -0.2 | -1.84 | 1.702 |
| 4.514468643208391 | -0.197 | -1.845 | 1.678 |
| 4.517610235861981 | -0.194 | -1.85 | 1.655 |
| 4.520751828515571 | -0.19 | -1.855 | 1.631 |
| 4.52389342116916 | -0.187 | -1.86 | 1.607 |
| 4.52703501382275 | -0.184 | -1.864 | 1.584 |
| 4.530176606476339 | -0.181 | -1.869 | 1.559 |
| 4.533318199129928 | -0.178 | -1.873 | 1.535 |
| 4.536459791783518 | -0.175 | -1.877 | 1.511 |
| 4.539601384437108 | -0.172 | -1.882 | 1.486 |
| 4.542742977090698 | -0.169 | -1.886 | 1.462 |
| 4.545884569744287 | -0.166 | -1.89 | 1.437 |
| 4.549026162397876 | -0.163 | -1.894 | 1.412 |
| 4.552167755051466 | -0.16 | -1.898 | 1.387 |
| 4.555309347705056 | -0.156 | -1.902 | 1.362 |
| 4.558450940358646 | -0.153 | -1.906 | 1.337 |
| 4.561592533012235 | -0.15 | -1.91 | 1.311 |
| 4.564734125665825 | -0.147 | -1.913 | 1.286 |
| 4.567875718319415 | -0.144 | -1.917 | 1.26 |
| 4.571017310973004 | -0.141 | -1.921 | 1.235 |
| 4.574158903626594 | -0.138 | -1.924 | 1.209 |
| 4.577300496280183 | -0.135 | -1.927 | 1.183 |
| 4.580442088933772 | -0.132 | -1.931 | 1.157 |
| 4.583583681587362 | -0.128 | -1.934 | 1.131 |
| 4.586725274240952 | -0.125 | -1.937 | 1.104 |
| 4.589866866894542 | -0.122 | -1.94 | 1.078 |
| 4.593008459548131 | -0.119 | -1.943 | 1.052 |
| 4.596150052201721 | -0.116 | -1.946 | 1.025 |
| 4.59929164485531 | -0.113 | -1.949 | 0.998 |
| 4.6024332375089 | -0.11 | -1.952 | 0.972 |
| 4.60557483016249 | -0.107 | -1.955 | 0.945 |
| 4.608716422816079 | -0.103 | -1.957 | 0.918 |
| 4.611858015469668 | -0.1 | -1.96 | 0.891 |
| 4.614999608123258 | -0.097 | -1.962 | 0.864 |
| 4.618141200776848 | -0.094 | -1.965 | 0.837 |
| 4.621282793430437 | -0.091 | -1.967 | 0.81 |
| 4.624424386084027 | -0.088 | -1.969 | 0.783 |
| 4.627565978737617 | -0.085 | -1.971 | 0.755 |
| 4.630707571391206 | -0.082 | -1.973 | 0.728 |
| 4.633849164044795 | -0.078 | -1.975 | 0.7 |
| 4.636990756698386 | -0.075 | -1.977 | 0.673 |
| 4.640132349351975 | -0.072 | -1.979 | 0.645 |
| 4.643273942005564 | -0.069 | -1.981 | 0.618 |
| 4.646415534659154 | -0.066 | -1.983 | 0.59 |
| 4.649557127312744 | -0.063 | -1.984 | 0.562 |
| 4.652698719966334 | -0.06 | -1.986 | 0.534 |
| 4.655840312619923 | -0.057 | -1.987 | 0.507 |
| 4.658981905273513 | -0.053 | -1.989 | 0.479 |
| 4.662123497927102 | -0.05 | -1.99 | 0.451 |
| 4.665265090580692 | -0.047 | -1.991 | 0.423 |
| 4.668406683234282 | -0.044 | -1.992 | 0.395 |
| 4.671548275887871 | -0.041 | -1.993 | 0.367 |
| 4.674689868541461 | -0.038 | -1.994 | 0.339 |
| 4.67783146119505 | -0.035 | -1.995 | 0.31 |
| 4.68097305384864 | -0.031 | -1.996 | 0.282 |
| 4.68411464650223 | -0.028 | -1.997 | 0.254 |
| 4.687256239155819 | -0.025 | -1.997 | 0.226 |
| 4.690397831809409 | -0.022 | -1.998 | 0.198 |
| 4.693539424462998 | -0.019 | -1.999 | 0.17 |
| 4.696681017116588 | -0.016 | -1.999 | 0.141 |
| 4.699822609770177 | -0.013 | -1.999 | 0.113 |
| 4.702964202423767 | -0.009 | -2 | 0.085 |
| 4.706105795077356 | -0.006 | -2 | 0.057 |
| 4.709247387730946 | -0.003 | -2 | 0.028 |
| 4.712388980384535 | 0 | -2 | 0 |
| 4.715530573038126 | 0.003 | -2 | -0.028 |
| 4.718672165691715 | 0.006 | -2 | -0.057 |
| 4.721813758345305 | 0.009 | -2 | -0.085 |
| 4.724955350998894 | 0.013 | -1.999 | -0.113 |
| 4.728096943652484 | 0.016 | -1.999 | -0.141 |
| 4.731238536306074 | 0.019 | -1.999 | -0.17 |
| 4.734380128959663 | 0.022 | -1.998 | -0.198 |
| 4.737521721613253 | 0.025 | -1.997 | -0.226 |
| 4.740663314266842 | 0.028 | -1.997 | -0.254 |
| 4.743804906920432 | 0.031 | -1.996 | -0.282 |
| 4.74694649957402 | 0.035 | -1.995 | -0.31 |
| 4.750088092227611 | 0.038 | -1.994 | -0.339 |
| 4.7532296848812 | 0.041 | -1.993 | -0.367 |
| 4.75637127753479 | 0.044 | -1.992 | -0.395 |
| 4.75951287018838 | 0.047 | -1.991 | -0.423 |
| 4.76265446284197 | 0.05 | -1.99 | -0.451 |
| 4.765796055495559 | 0.053 | -1.989 | -0.479 |
| 4.768937648149149 | 0.057 | -1.987 | -0.507 |
| 4.772079240802738 | 0.06 | -1.986 | -0.534 |
| 4.775220833456327 | 0.063 | -1.984 | -0.562 |
| 4.778362426109917 | 0.066 | -1.983 | -0.59 |
| 4.781504018763507 | 0.069 | -1.981 | -0.618 |
| 4.784645611417097 | 0.072 | -1.979 | -0.645 |
| 4.787787204070686 | 0.075 | -1.977 | -0.673 |
| 4.790928796724275 | 0.078 | -1.975 | -0.7 |
| 4.794070389377865 | 0.082 | -1.973 | -0.728 |
| 4.797211982031455 | 0.085 | -1.971 | -0.755 |
| 4.800353574685045 | 0.088 | -1.969 | -0.783 |
| 4.803495167338634 | 0.091 | -1.967 | -0.81 |
| 4.806636759992224 | 0.094 | -1.965 | -0.837 |
| 4.809778352645814 | 0.097 | -1.962 | -0.864 |
| 4.812919945299403 | 0.1 | -1.96 | -0.891 |
| 4.816061537952993 | 0.103 | -1.957 | -0.918 |
| 4.819203130606582 | 0.107 | -1.955 | -0.945 |
| 4.822344723260172 | 0.11 | -1.952 | -0.972 |
| 4.825486315913761 | 0.113 | -1.949 | -0.998 |
| 4.828627908567351 | 0.116 | -1.946 | -1.025 |
| 4.83176950122094 | 0.119 | -1.943 | -1.052 |
| 4.83491109387453 | 0.122 | -1.94 | -1.078 |
| 4.83805268652812 | 0.125 | -1.937 | -1.104 |
| 4.841194279181709 | 0.128 | -1.934 | -1.131 |
| 4.844335871835299 | 0.132 | -1.931 | -1.157 |
| 4.847477464488889 | 0.135 | -1.927 | -1.183 |
| 4.850619057142478 | 0.138 | -1.924 | -1.209 |
| 4.853760649796068 | 0.141 | -1.921 | -1.235 |
| 4.856902242449657 | 0.144 | -1.917 | -1.26 |
| 4.860043835103247 | 0.147 | -1.913 | -1.286 |
| 4.863185427756837 | 0.15 | -1.91 | -1.311 |
| 4.866327020410426 | 0.153 | -1.906 | -1.337 |
| 4.869468613064015 | 0.156 | -1.902 | -1.362 |
| 4.872610205717605 | 0.16 | -1.898 | -1.387 |
| 4.875751798371195 | 0.163 | -1.894 | -1.412 |
| 4.878893391024784 | 0.166 | -1.89 | -1.437 |
| 4.882034983678374 | 0.169 | -1.886 | -1.462 |
| 4.885176576331964 | 0.172 | -1.882 | -1.486 |
| 4.888318168985553 | 0.175 | -1.877 | -1.511 |
| 4.891459761639143 | 0.178 | -1.873 | -1.535 |
| 4.894601354292733 | 0.181 | -1.869 | -1.559 |
| 4.897742946946322 | 0.184 | -1.864 | -1.584 |
| 4.900884539599912 | 0.187 | -1.86 | -1.607 |
| 4.904026132253501 | 0.19 | -1.855 | -1.631 |
| 4.907167724907091 | 0.194 | -1.85 | -1.655 |
| 4.91030931756068 | 0.197 | -1.845 | -1.678 |
| 4.91345091021427 | 0.2 | -1.84 | -1.702 |
| 4.91659250286786 | 0.203 | -1.836 | -1.725 |
| 4.91973409552145 | 0.206 | -1.83 | -1.748 |
| 4.922875688175039 | 0.209 | -1.825 | -1.771 |
| 4.926017280828628 | 0.212 | -1.82 | -1.794 |
| 4.929158873482218 | 0.215 | -1.815 | -1.816 |
| 4.932300466135808 | 0.218 | -1.81 | -1.839 |
| 4.935442058789397 | 0.221 | -1.804 | -1.861 |
| 4.938583651442987 | 0.224 | -1.799 | -1.883 |
| 4.941725244096576 | 0.227 | -1.793 | -1.905 |
| 4.944866836750166 | 0.23 | -1.788 | -1.927 |
| 4.948008429403755 | 0.233 | -1.782 | -1.948 |
| 4.951150022057345 | 0.236 | -1.776 | -1.97 |
| 4.954291614710935 | 0.24 | -1.77 | -1.991 |
| 4.957433207364524 | 0.243 | -1.765 | -2.012 |
| 4.960574800018114 | 0.246 | -1.759 | -2.033 |
| 4.963716392671704 | 0.249 | -1.753 | -2.054 |
| 4.966857985325293 | 0.252 | -1.747 | -2.074 |
| 4.969999577978883 | 0.255 | -1.74 | -2.094 |
| 4.973141170632472 | 0.258 | -1.734 | -2.115 |
| 4.976282763286062 | 0.261 | -1.728 | -2.135 |
| 4.979424355939651 | 0.264 | -1.721 | -2.154 |
| 4.982565948593241 | 0.267 | -1.715 | -2.174 |
| 4.985707541246831 | 0.27 | -1.709 | -2.193 |
| 4.98884913390042 | 0.273 | -1.702 | -2.213 |
| 4.99199072655401 | 0.276 | -1.695 | -2.232 |
| 4.9951323192076 | 0.279 | -1.689 | -2.25 |
| 4.99827391186119 | 0.282 | -1.682 | -2.269 |
| 5.00141550451478 | 0.285 | -1.675 | -2.287 |
| 5.004557097168369 | 0.288 | -1.668 | -2.306 |
| 5.007698689821958 | 0.291 | -1.661 | -2.324 |
| 5.010840282475548 | 0.294 | -1.654 | -2.341 |
| 5.013981875129137 | 0.297 | -1.647 | -2.359 |
| 5.017123467782727 | 0.3 | -1.64 | -2.376 |
| 5.020265060436317 | 0.303 | -1.633 | -2.393 |
| 5.023406653089906 | 0.306 | -1.625 | -2.41 |
| 5.026548245743496 | 0.309 | -1.618 | -2.427 |
| 5.029689838397085 | 0.312 | -1.611 | -2.444 |
| 5.032831431050674 | 0.315 | -1.603 | -2.46 |
| 5.035973023704264 | 0.318 | -1.596 | -2.476 |
| 5.039114616357854 | 0.321 | -1.588 | -2.492 |
| 5.042256209011444 | 0.324 | -1.58 | -2.507 |
| 5.045397801665033 | 0.327 | -1.573 | -2.523 |
| 5.048539394318622 | 0.33 | -1.565 | -2.538 |
| 5.051680986972213 | 0.333 | -1.557 | -2.553 |
| 5.054822579625802 | 0.336 | -1.549 | -2.568 |
| 5.057964172279392 | 0.339 | -1.541 | -2.582 |
| 5.061105764932981 | 0.342 | -1.533 | -2.597 |
| 5.064247357586571 | 0.345 | -1.525 | -2.611 |
| 5.067388950240161 | 0.348 | -1.517 | -2.624 |
| 5.07053054289375 | 0.351 | -1.509 | -2.638 |
| 5.07367213554734 | 0.353 | -1.5 | -2.651 |
| 5.07681372820093 | 0.356 | -1.492 | -2.664 |
| 5.079955320854519 | 0.359 | -1.483 | -2.677 |
| 5.083096913508108 | 0.362 | -1.475 | -2.69 |
| 5.086238506161698 | 0.365 | -1.467 | -2.702 |
| 5.089380098815288 | 0.368 | -1.458 | -2.714 |
| 5.092521691468877 | 0.371 | -1.449 | -2.726 |
| 5.095663284122466 | 0.374 | -1.441 | -2.738 |
| 5.098804876776057 | 0.377 | -1.432 | -2.75 |
| 5.101946469429646 | 0.38 | -1.423 | -2.761 |
| 5.105088062083236 | 0.383 | -1.414 | -2.772 |
| 5.108229654736825 | 0.386 | -1.405 | -2.782 |
| 5.111371247390415 | 0.388 | -1.396 | -2.793 |
| 5.114512840044005 | 0.391 | -1.387 | -2.803 |
| 5.117654432697594 | 0.394 | -1.378 | -2.813 |
| 5.120796025351184 | 0.397 | -1.369 | -2.823 |
| 5.123937618004773 | 0.4 | -1.36 | -2.832 |
| 5.127079210658363 | 0.403 | -1.351 | -2.841 |
| 5.130220803311953 | 0.406 | -1.341 | -2.85 |
| 5.133362395965542 | 0.409 | -1.332 | -2.859 |
| 5.136503988619131 | 0.412 | -1.323 | -2.867 |
| 5.13964558127272 | 0.414 | -1.313 | -2.876 |
| 5.142787173926311 | 0.417 | -1.304 | -2.883 |
| 5.1459287665799 | 0.42 | -1.294 | -2.891 |
| 5.14907035923349 | 0.423 | -1.285 | -2.899 |
| 5.15221195188708 | 0.426 | -1.275 | -2.906 |
| 5.15535354454067 | 0.429 | -1.265 | -2.913 |
| 5.158495137194259 | 0.431 | -1.255 | -2.919 |
| 5.161636729847848 | 0.434 | -1.246 | -2.926 |
| 5.164778322501438 | 0.437 | -1.236 | -2.932 |
| 5.167919915155028 | 0.44 | -1.226 | -2.938 |
| 5.171061507808617 | 0.443 | -1.216 | -2.943 |
| 5.174203100462206 | 0.446 | -1.206 | -2.949 |
| 5.177344693115796 | 0.448 | -1.196 | -2.954 |
| 5.180486285769386 | 0.451 | -1.186 | -2.959 |
| 5.183627878422976 | 0.454 | -1.176 | -2.963 |
| 5.186769471076565 | 0.457 | -1.165 | -2.967 |
| 5.189911063730155 | 0.46 | -1.155 | -2.971 |
| 5.193052656383744 | 0.462 | -1.145 | -2.975 |
| 5.196194249037334 | 0.465 | -1.135 | -2.979 |
| 5.199335841690924 | 0.468 | -1.124 | -2.982 |
| 5.202477434344513 | 0.471 | -1.114 | -2.985 |
| 5.205619026998103 | 0.473 | -1.103 | -2.988 |
| 5.208760619651692 | 0.476 | -1.093 | -2.99 |
| 5.211902212305282 | 0.479 | -1.082 | -2.992 |
| 5.215043804958871 | 0.482 | -1.072 | -2.994 |
| 5.218185397612461 | 0.485 | -1.061 | -2.996 |
| 5.221326990266051 | 0.487 | -1.05 | -2.997 |
| 5.22446858291964 | 0.49 | -1.04 | -2.998 |
| 5.22761017557323 | 0.493 | -1.029 | -2.999 |
| 5.23075176822682 | 0.495 | -1.018 | -3 |
| 5.23389336088041 | 0.498 | -1.007 | -3 |
| 5.237034953533999 | 0.501 | -0.996 | -3 |
| 5.240176546187588 | 0.504 | -0.985 | -3 |
| 5.243318138841178 | 0.506 | -0.975 | -2.999 |
| 5.246459731494767 | 0.509 | -0.964 | -2.999 |
| 5.249601324148357 | 0.512 | -0.952 | -2.997 |
| 5.252742916801947 | 0.514 | -0.941 | -2.996 |
| 5.255884509455536 | 0.517 | -0.93 | -2.995 |
| 5.259026102109125 | 0.52 | -0.919 | -2.993 |
| 5.262167694762715 | 0.522 | -0.908 | -2.991 |
| 5.265309287416305 | 0.525 | -0.897 | -2.988 |
| 5.268450880069895 | 0.528 | -0.886 | -2.986 |
| 5.271592472723484 | 0.531 | -0.874 | -2.983 |
| 5.274734065377074 | 0.533 | -0.863 | -2.98 |
| 5.277875658030664 | 0.536 | -0.852 | -2.976 |
| 5.281017250684253 | 0.538 | -0.84 | -2.973 |
| 5.284158843337843 | 0.541 | -0.829 | -2.969 |
| 5.287300435991432 | 0.544 | -0.817 | -2.965 |
| 5.290442028645022 | 0.546 | -0.806 | -2.96 |
| 5.293583621298612 | 0.549 | -0.794 | -2.955 |
| 5.296725213952201 | 0.552 | -0.783 | -2.95 |
| 5.299866806605791 | 0.554 | -0.771 | -2.945 |
| 5.30300839925938 | 0.557 | -0.76 | -2.94 |
| 5.30614999191297 | 0.559 | -0.748 | -2.934 |
| 5.30929158456656 | 0.562 | -0.736 | -2.928 |
| 5.312433177220149 | 0.565 | -0.725 | -2.921 |
| 5.315574769873739 | 0.567 | -0.713 | -2.915 |
| 5.318716362527328 | 0.57 | -0.701 | -2.908 |
| 5.321857955180918 | 0.572 | -0.689 | -2.901 |
| 5.324999547834508 | 0.575 | -0.677 | -2.894 |
| 5.328141140488097 | 0.578 | -0.666 | -2.886 |
| 5.331282733141686 | 0.58 | -0.654 | -2.878 |
| 5.334424325795276 | 0.583 | -0.642 | -2.87 |
| 5.337565918448866 | 0.585 | -0.63 | -2.862 |
| 5.340707511102456 | 0.588 | -0.618 | -2.853 |
| 5.343849103756045 | 0.59 | -0.606 | -2.844 |
| 5.346990696409634 | 0.593 | -0.594 | -2.835 |
| 5.350132289063224 | 0.595 | -0.582 | -2.826 |
| 5.353273881716814 | 0.598 | -0.57 | -2.816 |
| 5.356415474370403 | 0.6 | -0.558 | -2.806 |
| 5.359557067023993 | 0.603 | -0.546 | -2.796 |
| 5.362698659677583 | 0.605 | -0.534 | -2.786 |
| 5.365840252331172 | 0.608 | -0.522 | -2.775 |
| 5.368981844984762 | 0.61 | -0.51 | -2.764 |
| 5.372123437638351 | 0.613 | -0.497 | -2.753 |
| 5.375265030291941 | 0.615 | -0.485 | -2.742 |
| 5.378406622945531 | 0.618 | -0.473 | -2.73 |
| 5.38154821559912 | 0.62 | -0.461 | -2.718 |
| 5.38468980825271 | 0.623 | -0.449 | -2.706 |
| 5.387831400906299 | 0.625 | -0.436 | -2.694 |
| 5.39097299355989 | 0.628 | -0.424 | -2.682 |
| 5.394114586213479 | 0.63 | -0.412 | -2.669 |
| 5.397256178867068 | 0.633 | -0.399 | -2.656 |
| 5.400397771520657 | 0.635 | -0.387 | -2.642 |
| 5.403539364174247 | 0.637 | -0.375 | -2.629 |
| 5.406680956827837 | 0.64 | -0.362 | -2.615 |
| 5.409822549481426 | 0.642 | -0.35 | -2.601 |
| 5.412964142135016 | 0.645 | -0.338 | -2.587 |
| 5.416105734788605 | 0.647 | -0.325 | -2.573 |
| 5.419247327442195 | 0.649 | -0.313 | -2.558 |
| 5.422388920095785 | 0.652 | -0.3 | -2.543 |
| 5.425530512749375 | 0.654 | -0.288 | -2.528 |
| 5.428672105402964 | 0.657 | -0.276 | -2.513 |
| 5.431813698056554 | 0.659 | -0.263 | -2.497 |
| 5.434955290710143 | 0.661 | -0.251 | -2.481 |
| 5.438096883363733 | 0.664 | -0.238 | -2.465 |
| 5.441238476017322 | 0.666 | -0.226 | -2.449 |
| 5.444380068670912 | 0.668 | -0.213 | -2.433 |
| 5.447521661324502 | 0.671 | -0.201 | -2.416 |
| 5.450663253978091 | 0.673 | -0.188 | -2.399 |
| 5.453804846631681 | 0.675 | -0.176 | -2.382 |
| 5.456946439285271 | 0.678 | -0.163 | -2.365 |
| 5.46008803193886 | 0.68 | -0.151 | -2.347 |
| 5.46322962459245 | 0.682 | -0.138 | -2.329 |
| 5.466371217246039 | 0.685 | -0.126 | -2.312 |
| 5.46951280989963 | 0.687 | -0.113 | -2.293 |
| 5.472654402553218 | 0.689 | -0.1 | -2.275 |
| 5.475795995206808 | 0.691 | -0.088 | -2.257 |
| 5.478937587860398 | 0.694 | -0.075 | -2.238 |
| 5.482079180513987 | 0.696 | -0.063 | -2.219 |
| 5.485220773167577 | 0.698 | -0.05 | -2.2 |
| 5.488362365821166 | 0.7 | -0.038 | -2.18 |
| 5.491503958474756 | 0.703 | -0.025 | -2.161 |
| 5.494645551128346 | 0.705 | -0.013 | -2.141 |
| 5.497787143781935 | 0.707 | 0 | -2.121 |
| 5.500928736435525 | 0.709 | 0.013 | -2.101 |
| 5.504070329089115 | 0.712 | 0.025 | -2.081 |
| 5.507211921742704 | 0.714 | 0.038 | -2.061 |
| 5.510353514396294 | 0.716 | 0.05 | -2.04 |
| 5.513495107049883 | 0.718 | 0.063 | -2.019 |
| 5.516636699703473 | 0.72 | 0.075 | -1.998 |
| 5.519778292357062 | 0.722 | 0.088 | -1.977 |
| 5.522919885010652 | 0.725 | 0.1 | -1.956 |
| 5.526061477664242 | 0.727 | 0.113 | -1.934 |
| 5.529203070317831 | 0.729 | 0.126 | -1.912 |
| 5.532344662971421 | 0.731 | 0.138 | -1.89 |
| 5.535486255625011 | 0.733 | 0.151 | -1.868 |
| 5.5386278482786 | 0.735 | 0.163 | -1.846 |
| 5.54176944093219 | 0.738 | 0.176 | -1.824 |
| 5.544911033585779 | 0.74 | 0.188 | -1.801 |
| 5.54805262623937 | 0.742 | 0.201 | -1.779 |
| 5.551194218892959 | 0.744 | 0.213 | -1.756 |
| 5.554335811546548 | 0.746 | 0.226 | -1.733 |
| 5.557477404200137 | 0.748 | 0.238 | -1.71 |
| 5.560618996853727 | 0.75 | 0.251 | -1.686 |
| 5.563760589507317 | 0.752 | 0.263 | -1.663 |
| 5.566902182160906 | 0.754 | 0.276 | -1.639 |
| 5.570043774814496 | 0.756 | 0.288 | -1.615 |
| 5.573185367468086 | 0.758 | 0.3 | -1.592 |
| 5.576326960121675 | 0.76 | 0.313 | -1.567 |
| 5.579468552775264 | 0.762 | 0.325 | -1.543 |
| 5.582610145428854 | 0.764 | 0.338 | -1.519 |
| 5.585751738082444 | 0.766 | 0.35 | -1.495 |
| 5.588893330736034 | 0.769 | 0.362 | -1.47 |
| 5.592034923389623 | 0.771 | 0.375 | -1.445 |
| 5.595176516043213 | 0.773 | 0.387 | -1.42 |
| 5.598318108696803 | 0.775 | 0.399 | -1.395 |
| 5.601459701350392 | 0.776 | 0.412 | -1.37 |
| 5.604601294003982 | 0.778 | 0.424 | -1.345 |
| 5.607742886657571 | 0.78 | 0.436 | -1.32 |
| 5.610884479311161 | 0.782 | 0.449 | -1.294 |
| 5.61402607196475 | 0.784 | 0.461 | -1.269 |
| 5.61716766461834 | 0.786 | 0.473 | -1.243 |
| 5.62030925727193 | 0.788 | 0.485 | -1.217 |
| 5.623450849925519 | 0.79 | 0.497 | -1.191 |
| 5.626592442579109 | 0.792 | 0.51 | -1.165 |
| 5.629734035232698 | 0.794 | 0.522 | -1.139 |
| 5.632875627886288 | 0.796 | 0.534 | -1.113 |
| 5.636017220539878 | 0.798 | 0.546 | -1.087 |
| 5.639158813193467 | 0.8 | 0.558 | -1.06 |
| 5.642300405847057 | 0.802 | 0.57 | -1.034 |
| 5.645441998500646 | 0.803 | 0.582 | -1.007 |
| 5.648583591154236 | 0.805 | 0.594 | -0.981 |
| 5.651725183807825 | 0.807 | 0.606 | -0.954 |
| 5.654866776461415 | 0.809 | 0.618 | -0.927 |
| 5.658008369115005 | 0.811 | 0.63 | -0.9 |
| 5.661149961768594 | 0.813 | 0.642 | -0.873 |
| 5.664291554422184 | 0.815 | 0.654 | -0.846 |
| 5.667433147075774 | 0.816 | 0.666 | -0.819 |
| 5.670574739729363 | 0.818 | 0.677 | -0.792 |
| 5.673716332382953 | 0.82 | 0.689 | -0.764 |
| 5.676857925036542 | 0.822 | 0.701 | -0.737 |
| 5.679999517690132 | 0.824 | 0.713 | -0.709 |
| 5.683141110343721 | 0.825 | 0.725 | -0.682 |
| 5.686282702997311 | 0.827 | 0.736 | -0.654 |
| 5.689424295650901 | 0.829 | 0.748 | -0.627 |
| 5.69256588830449 | 0.831 | 0.76 | -0.599 |
| 5.69570748095808 | 0.832 | 0.771 | -0.571 |
| 5.69884907361167 | 0.834 | 0.783 | -0.544 |
| 5.701990666265259 | 0.836 | 0.794 | -0.516 |
| 5.705132258918849 | 0.838 | 0.806 | -0.488 |
| 5.708273851572438 | 0.839 | 0.817 | -0.46 |
| 5.711415444226028 | 0.841 | 0.829 | -0.432 |
| 5.714557036879618 | 0.843 | 0.84 | -0.404 |
| 5.717698629533207 | 0.844 | 0.852 | -0.376 |
| 5.720840222186797 | 0.846 | 0.863 | -0.348 |
| 5.723981814840386 | 0.848 | 0.874 | -0.32 |
| 5.727123407493976 | 0.849 | 0.886 | -0.292 |
| 5.730265000147565 | 0.851 | 0.897 | -0.264 |
| 5.733406592801155 | 0.853 | 0.908 | -0.235 |
| 5.736548185454744 | 0.854 | 0.919 | -0.207 |
| 5.739689778108334 | 0.856 | 0.93 | -0.179 |
| 5.742831370761924 | 0.858 | 0.941 | -0.151 |
| 5.745972963415514 | 0.859 | 0.952 | -0.122 |
| 5.749114556069103 | 0.861 | 0.964 | -0.094 |
| 5.752256148722693 | 0.862 | 0.975 | -0.066 |
| 5.755397741376282 | 0.864 | 0.985 | -0.038 |
| 5.758539334029872 | 0.866 | 0.996 | -0.009 |
| 5.761680926683462 | 0.867 | 1.007 | 0.019 |
| 5.764822519337051 | 0.869 | 1.018 | 0.047 |
| 5.767964111990641 | 0.87 | 1.029 | 0.075 |
| 5.77110570464423 | 0.872 | 1.04 | 0.104 |
| 5.77424729729782 | 0.873 | 1.05 | 0.132 |
| 5.77738888995141 | 0.875 | 1.061 | 0.16 |
| 5.780530482605 | 0.876 | 1.072 | 0.188 |
| 5.783672075258588 | 0.878 | 1.082 | 0.217 |
| 5.786813667912178 | 0.879 | 1.093 | 0.245 |
| 5.789955260565768 | 0.881 | 1.103 | 0.273 |
| 5.793096853219358 | 0.882 | 1.114 | 0.301 |
| 5.796238445872947 | 0.884 | 1.124 | 0.329 |
| 5.799380038526537 | 0.885 | 1.135 | 0.357 |
| 5.802521631180126 | 0.887 | 1.145 | 0.385 |
| 5.805663223833715 | 0.888 | 1.155 | 0.413 |
| 5.808804816487306 | 0.89 | 1.165 | 0.441 |
| 5.811946409140895 | 0.891 | 1.176 | 0.469 |
| 5.815088001794485 | 0.892 | 1.186 | 0.497 |
| 5.818229594448074 | 0.894 | 1.196 | 0.525 |
| 5.821371187101663 | 0.895 | 1.206 | 0.553 |
| 5.824512779755254 | 0.897 | 1.216 | 0.581 |
| 5.827654372408843 | 0.898 | 1.226 | 0.608 |
| 5.830795965062433 | 0.899 | 1.236 | 0.636 |
| 5.833937557716022 | 0.901 | 1.246 | 0.664 |
| 5.837079150369612 | 0.902 | 1.255 | 0.691 |
| 5.840220743023201 | 0.903 | 1.265 | 0.719 |
| 5.843362335676791 | 0.905 | 1.275 | 0.746 |
| 5.846503928330381 | 0.906 | 1.285 | 0.773 |
| 5.84964552098397 | 0.907 | 1.294 | 0.801 |
| 5.85278711363756 | 0.909 | 1.304 | 0.828 |
| 5.85592870629115 | 0.91 | 1.313 | 0.855 |
| 5.85907029894474 | 0.911 | 1.323 | 0.882 |
| 5.862211891598329 | 0.913 | 1.332 | 0.909 |
| 5.865353484251918 | 0.914 | 1.341 | 0.936 |
| 5.868495076905508 | 0.915 | 1.351 | 0.963 |
| 5.871636669559098 | 0.917 | 1.36 | 0.99 |
| 5.874778262212687 | 0.918 | 1.369 | 1.016 |
| 5.877919854866277 | 0.919 | 1.378 | 1.043 |
| 5.881061447519866 | 0.92 | 1.387 | 1.069 |
| 5.884203040173456 | 0.921 | 1.396 | 1.096 |
| 5.887344632827046 | 0.923 | 1.405 | 1.122 |
| 5.890486225480635 | 0.924 | 1.414 | 1.148 |
| 5.893627818134224 | 0.925 | 1.423 | 1.174 |
| 5.896769410787814 | 0.926 | 1.432 | 1.2 |
| 5.899911003441404 | 0.927 | 1.441 | 1.226 |
| 5.903052596094994 | 0.929 | 1.449 | 1.252 |
| 5.906194188748583 | 0.93 | 1.458 | 1.277 |
| 5.909335781402172 | 0.931 | 1.467 | 1.303 |
| 5.912477374055762 | 0.932 | 1.475 | 1.328 |
| 5.915618966709352 | 0.933 | 1.483 | 1.354 |
| 5.918760559362942 | 0.934 | 1.492 | 1.379 |
| 5.921902152016531 | 0.935 | 1.5 | 1.404 |
| 5.92504374467012 | 0.937 | 1.509 | 1.429 |
| 5.92818533732371 | 0.938 | 1.517 | 1.454 |
| 5.9313269299773 | 0.939 | 1.525 | 1.478 |
| 5.93446852263089 | 0.94 | 1.533 | 1.503 |
| 5.93761011528448 | 0.941 | 1.541 | 1.527 |
| 5.940751707938068 | 0.942 | 1.549 | 1.551 |
| 5.943893300591658 | 0.943 | 1.557 | 1.576 |
| 5.947034893245248 | 0.944 | 1.565 | 1.6 |
| 5.950176485898837 | 0.945 | 1.573 | 1.623 |
| 5.953318078552427 | 0.946 | 1.58 | 1.647 |
| 5.956459671206017 | 0.947 | 1.588 | 1.671 |
| 5.959601263859606 | 0.948 | 1.596 | 1.694 |
| 5.962742856513196 | 0.949 | 1.603 | 1.717 |
| 5.965884449166785 | 0.95 | 1.611 | 1.74 |
| 5.969026041820375 | 0.951 | 1.618 | 1.763 |
| 5.972167634473964 | 0.952 | 1.625 | 1.786 |
| 5.975309227127554 | 0.953 | 1.633 | 1.809 |
| 5.978450819781144 | 0.954 | 1.64 | 1.831 |
| 5.981592412434733 | 0.955 | 1.647 | 1.854 |
| 5.984734005088323 | 0.956 | 1.654 | 1.876 |
| 5.987875597741913 | 0.957 | 1.661 | 1.898 |
| 5.991017190395502 | 0.958 | 1.668 | 1.92 |
| 5.994158783049092 | 0.959 | 1.675 | 1.941 |
| 5.997300375702681 | 0.959 | 1.682 | 1.963 |
| 6.000441968356271 | 0.96 | 1.689 | 1.984 |
| 6.003583561009861 | 0.961 | 1.695 | 2.005 |
| 6.00672515366345 | 0.962 | 1.702 | 2.026 |
| 6.00986674631704 | 0.963 | 1.709 | 2.047 |
| 6.01300833897063 | 0.964 | 1.715 | 2.067 |
| 6.01614993162422 | 0.965 | 1.721 | 2.088 |
| 6.019291524277808 | 0.965 | 1.728 | 2.108 |
| 6.022433116931398 | 0.966 | 1.734 | 2.128 |
| 6.025574709584988 | 0.967 | 1.74 | 2.148 |
| 6.028716302238577 | 0.968 | 1.747 | 2.167 |
| 6.031857894892167 | 0.969 | 1.753 | 2.187 |
| 6.034999487545757 | 0.969 | 1.759 | 2.206 |
| 6.038141080199346 | 0.97 | 1.765 | 2.225 |
| 6.041282672852935 | 0.971 | 1.77 | 2.244 |
| 6.044424265506525 | 0.972 | 1.776 | 2.263 |
| 6.047565858160115 | 0.972 | 1.782 | 2.281 |
| 6.050707450813704 | 0.973 | 1.788 | 2.299 |
| 6.053849043467294 | 0.974 | 1.793 | 2.318 |
| 6.056990636120884 | 0.975 | 1.799 | 2.335 |
| 6.060132228774473 | 0.975 | 1.804 | 2.353 |
| 6.063273821428063 | 0.976 | 1.81 | 2.37 |
| 6.066415414081653 | 0.977 | 1.815 | 2.388 |
| 6.069557006735242 | 0.977 | 1.82 | 2.405 |
| 6.072698599388831 | 0.978 | 1.825 | 2.421 |
| 6.07584019204242 | 0.979 | 1.83 | 2.438 |
| 6.078981784696011 | 0.979 | 1.836 | 2.454 |
| 6.082123377349601 | 0.98 | 1.84 | 2.471 |
| 6.08526497000319 | 0.98 | 1.845 | 2.487 |
| 6.08840656265678 | 0.981 | 1.85 | 2.502 |
| 6.09154815531037 | 0.982 | 1.855 | 2.518 |
| 6.094689747963959 | 0.982 | 1.86 | 2.533 |
| 6.097831340617549 | 0.983 | 1.864 | 2.548 |
| 6.100972933271138 | 0.983 | 1.869 | 2.563 |
| 6.104114525924728 | 0.984 | 1.873 | 2.577 |
| 6.107256118578317 | 0.985 | 1.877 | 2.592 |
| 6.110397711231907 | 0.985 | 1.882 | 2.606 |
| 6.113539303885497 | 0.986 | 1.886 | 2.62 |
| 6.116680896539086 | 0.986 | 1.89 | 2.633 |
| 6.119822489192675 | 0.987 | 1.894 | 2.647 |
| 6.122964081846265 | 0.987 | 1.898 | 2.66 |
| 6.126105674499855 | 0.988 | 1.902 | 2.673 |
| 6.129247267153445 | 0.988 | 1.906 | 2.686 |
| 6.132388859807034 | 0.989 | 1.91 | 2.698 |
| 6.135530452460624 | 0.989 | 1.913 | 2.71 |
| 6.138672045114213 | 0.99 | 1.917 | 2.722 |
| 6.141813637767803 | 0.99 | 1.921 | 2.734 |
| 6.144955230421393 | 0.99 | 1.924 | 2.746 |
| 6.148096823074982 | 0.991 | 1.927 | 2.757 |
| 6.151238415728571 | 0.991 | 1.931 | 2.768 |
| 6.154380008382161 | 0.992 | 1.934 | 2.779 |
| 6.157521601035751 | 0.992 | 1.937 | 2.789 |
| 6.16066319368934 | 0.993 | 1.94 | 2.8 |
| 6.16380478634293 | 0.993 | 1.943 | 2.81 |
| 6.16694637899652 | 0.993 | 1.946 | 2.819 |
| 6.170087971650109 | 0.994 | 1.949 | 2.829 |
| 6.173229564303698 | 0.994 | 1.952 | 2.838 |
| 6.176371156957289 | 0.994 | 1.955 | 2.847 |
| 6.179512749610878 | 0.995 | 1.957 | 2.856 |
| 6.182654342264468 | 0.995 | 1.96 | 2.865 |
| 6.185795934918057 | 0.995 | 1.962 | 2.873 |
| 6.188937527571647 | 0.996 | 1.965 | 2.881 |
| 6.192079120225237 | 0.996 | 1.967 | 2.889 |
| 6.195220712878826 | 0.996 | 1.969 | 2.896 |
| 6.198362305532415 | 0.996 | 1.971 | 2.903 |
| 6.201503898186005 | 0.997 | 1.973 | 2.91 |
| 6.204645490839594 | 0.997 | 1.975 | 2.917 |
| 6.207787083493184 | 0.997 | 1.977 | 2.924 |
| 6.210928676146774 | 0.997 | 1.979 | 2.93 |
| 6.214070268800364 | 0.998 | 1.981 | 2.936 |
| 6.217211861453953 | 0.998 | 1.983 | 2.941 |
| 6.220353454107543 | 0.998 | 1.984 | 2.947 |
| 6.223495046761133 | 0.998 | 1.986 | 2.952 |
| 6.226636639414722 | 0.998 | 1.987 | 2.957 |
| 6.229778232068312 | 0.999 | 1.989 | 2.962 |
| 6.232919824721901 | 0.999 | 1.99 | 2.966 |
| 6.236061417375491 | 0.999 | 1.991 | 2.97 |
| 6.23920301002908 | 0.999 | 1.992 | 2.974 |
| 6.24234460268267 | 0.999 | 1.993 | 2.978 |
| 6.24548619533626 | 0.999 | 1.994 | 2.981 |
| 6.24862778798985 | 0.999 | 1.995 | 2.984 |
| 6.251769380643438 | 1 | 1.996 | 2.987 |
| 6.254910973297028 | 1 | 1.997 | 2.989 |
| 6.258052565950618 | 1 | 1.997 | 2.991 |
| 6.261194158604208 | 1 | 1.998 | 2.993 |
| 6.264335751257797 | 1 | 1.999 | 2.995 |
| 6.267477343911387 | 1 | 1.999 | 2.997 |
| 6.270618936564976 | 1 | 1.999 | 2.998 |
| 6.273760529218566 | 1 | 2 | 2.999 |
| 6.276902121872155 | 1 | 2 | 2.999 |
| 6.280043714525745 | 1 | 2 | 3 |
| 6.283185307179335 | 1 | 2 | 3 |